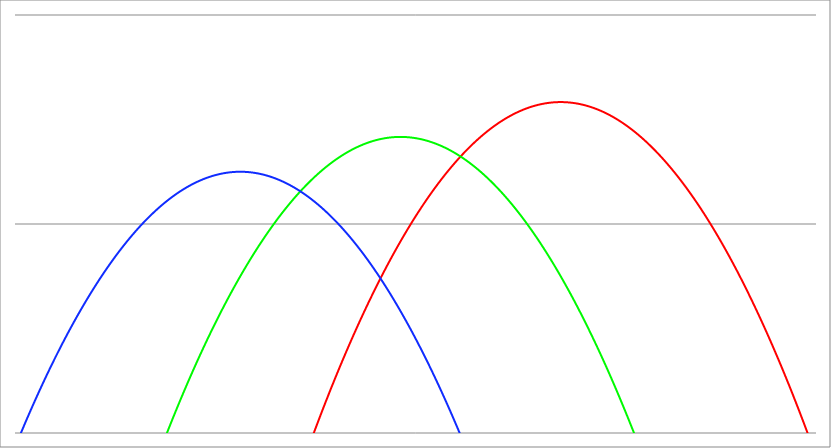
| Category | Series 1 | Series 0 | Series 2 |
|---|---|---|---|
| -4.8 | -42.74 | -20.54 | -6.34 |
| -4.795 | -42.672 | -20.492 | -6.312 |
| -4.79 | -42.604 | -20.444 | -6.284 |
| -4.785 | -42.536 | -20.396 | -6.256 |
| -4.78 | -42.468 | -20.348 | -6.228 |
| -4.775 | -42.401 | -20.301 | -6.201 |
| -4.77 | -42.333 | -20.253 | -6.173 |
| -4.765 | -42.265 | -20.205 | -6.145 |
| -4.760000000000001 | -42.198 | -20.158 | -6.118 |
| -4.755000000000001 | -42.13 | -20.11 | -6.09 |
| -4.750000000000001 | -42.063 | -20.063 | -6.063 |
| -4.745000000000001 | -41.995 | -20.015 | -6.035 |
| -4.740000000000001 | -41.928 | -19.968 | -6.008 |
| -4.735000000000001 | -41.86 | -19.92 | -5.98 |
| -4.730000000000001 | -41.793 | -19.873 | -5.953 |
| -4.725000000000001 | -41.726 | -19.826 | -5.926 |
| -4.720000000000001 | -41.658 | -19.778 | -5.898 |
| -4.715000000000002 | -41.591 | -19.731 | -5.871 |
| -4.710000000000002 | -41.524 | -19.684 | -5.844 |
| -4.705000000000002 | -41.457 | -19.637 | -5.817 |
| -4.700000000000002 | -41.39 | -19.59 | -5.79 |
| -4.695000000000002 | -41.323 | -19.543 | -5.763 |
| -4.690000000000002 | -41.256 | -19.496 | -5.736 |
| -4.685000000000002 | -41.189 | -19.449 | -5.709 |
| -4.680000000000002 | -41.122 | -19.402 | -5.682 |
| -4.675000000000002 | -41.056 | -19.356 | -5.656 |
| -4.670000000000002 | -40.989 | -19.309 | -5.629 |
| -4.665000000000003 | -40.922 | -19.262 | -5.602 |
| -4.660000000000003 | -40.856 | -19.216 | -5.576 |
| -4.655000000000003 | -40.789 | -19.169 | -5.549 |
| -4.650000000000003 | -40.723 | -19.123 | -5.523 |
| -4.645000000000003 | -40.656 | -19.076 | -5.496 |
| -4.640000000000003 | -40.59 | -19.03 | -5.47 |
| -4.635000000000003 | -40.523 | -18.983 | -5.443 |
| -4.630000000000003 | -40.457 | -18.937 | -5.417 |
| -4.625000000000003 | -40.391 | -18.891 | -5.391 |
| -4.620000000000004 | -40.324 | -18.844 | -5.364 |
| -4.615000000000004 | -40.258 | -18.798 | -5.338 |
| -4.610000000000004 | -40.192 | -18.752 | -5.312 |
| -4.605000000000004 | -40.126 | -18.706 | -5.286 |
| -4.600000000000004 | -40.06 | -18.66 | -5.26 |
| -4.595000000000004 | -39.994 | -18.614 | -5.234 |
| -4.590000000000004 | -39.928 | -18.568 | -5.208 |
| -4.585000000000004 | -39.862 | -18.522 | -5.182 |
| -4.580000000000004 | -39.796 | -18.476 | -5.156 |
| -4.575000000000004 | -39.731 | -18.431 | -5.131 |
| -4.570000000000004 | -39.665 | -18.385 | -5.105 |
| -4.565000000000005 | -39.599 | -18.339 | -5.079 |
| -4.560000000000005 | -39.534 | -18.294 | -5.054 |
| -4.555000000000005 | -39.468 | -18.248 | -5.028 |
| -4.550000000000005 | -39.403 | -18.203 | -5.003 |
| -4.545000000000005 | -39.337 | -18.157 | -4.977 |
| -4.540000000000005 | -39.272 | -18.112 | -4.952 |
| -4.535000000000005 | -39.206 | -18.066 | -4.926 |
| -4.530000000000005 | -39.141 | -18.021 | -4.901 |
| -4.525000000000006 | -39.076 | -17.976 | -4.876 |
| -4.520000000000006 | -39.01 | -17.93 | -4.85 |
| -4.515000000000006 | -38.945 | -17.885 | -4.825 |
| -4.510000000000006 | -38.88 | -17.84 | -4.8 |
| -4.505000000000006 | -38.815 | -17.795 | -4.775 |
| -4.500000000000006 | -38.75 | -17.75 | -4.75 |
| -4.495000000000006 | -38.685 | -17.705 | -4.725 |
| -4.490000000000006 | -38.62 | -17.66 | -4.7 |
| -4.485000000000006 | -38.555 | -17.615 | -4.675 |
| -4.480000000000006 | -38.49 | -17.57 | -4.65 |
| -4.475000000000006 | -38.426 | -17.526 | -4.626 |
| -4.470000000000006 | -38.361 | -17.481 | -4.601 |
| -4.465000000000007 | -38.296 | -17.436 | -4.576 |
| -4.460000000000007 | -38.232 | -17.392 | -4.552 |
| -4.455000000000007 | -38.167 | -17.347 | -4.527 |
| -4.450000000000007 | -38.103 | -17.303 | -4.503 |
| -4.445000000000007 | -38.038 | -17.258 | -4.478 |
| -4.440000000000007 | -37.974 | -17.214 | -4.454 |
| -4.435000000000007 | -37.909 | -17.169 | -4.429 |
| -4.430000000000007 | -37.845 | -17.125 | -4.405 |
| -4.425000000000008 | -37.781 | -17.081 | -4.381 |
| -4.420000000000008 | -37.716 | -17.036 | -4.356 |
| -4.415000000000008 | -37.652 | -16.992 | -4.332 |
| -4.410000000000008 | -37.588 | -16.948 | -4.308 |
| -4.405000000000008 | -37.524 | -16.904 | -4.284 |
| -4.400000000000008 | -37.46 | -16.86 | -4.26 |
| -4.395000000000008 | -37.396 | -16.816 | -4.236 |
| -4.390000000000008 | -37.332 | -16.772 | -4.212 |
| -4.385000000000009 | -37.268 | -16.728 | -4.188 |
| -4.380000000000009 | -37.204 | -16.684 | -4.164 |
| -4.375000000000009 | -37.141 | -16.641 | -4.141 |
| -4.370000000000009 | -37.077 | -16.597 | -4.117 |
| -4.365000000000009 | -37.013 | -16.553 | -4.093 |
| -4.360000000000009 | -36.95 | -16.51 | -4.07 |
| -4.355000000000009 | -36.886 | -16.466 | -4.046 |
| -4.350000000000009 | -36.823 | -16.423 | -4.023 |
| -4.345000000000009 | -36.759 | -16.379 | -3.999 |
| -4.34000000000001 | -36.696 | -16.336 | -3.976 |
| -4.33500000000001 | -36.632 | -16.292 | -3.952 |
| -4.33000000000001 | -36.569 | -16.249 | -3.929 |
| -4.32500000000001 | -36.506 | -16.206 | -3.906 |
| -4.32000000000001 | -36.442 | -16.162 | -3.882 |
| -4.31500000000001 | -36.379 | -16.119 | -3.859 |
| -4.31000000000001 | -36.316 | -16.076 | -3.836 |
| -4.30500000000001 | -36.253 | -16.033 | -3.813 |
| -4.30000000000001 | -36.19 | -15.99 | -3.79 |
| -4.295000000000011 | -36.127 | -15.947 | -3.767 |
| -4.290000000000011 | -36.064 | -15.904 | -3.744 |
| -4.285000000000011 | -36.001 | -15.861 | -3.721 |
| -4.280000000000011 | -35.938 | -15.818 | -3.698 |
| -4.275000000000011 | -35.876 | -15.776 | -3.676 |
| -4.270000000000011 | -35.813 | -15.733 | -3.653 |
| -4.265000000000011 | -35.75 | -15.69 | -3.63 |
| -4.260000000000011 | -35.688 | -15.648 | -3.608 |
| -4.255000000000011 | -35.625 | -15.605 | -3.585 |
| -4.250000000000012 | -35.563 | -15.563 | -3.563 |
| -4.245000000000012 | -35.5 | -15.52 | -3.54 |
| -4.240000000000012 | -35.438 | -15.478 | -3.518 |
| -4.235000000000012 | -35.375 | -15.435 | -3.495 |
| -4.230000000000012 | -35.313 | -15.393 | -3.473 |
| -4.225000000000012 | -35.251 | -15.351 | -3.451 |
| -4.220000000000012 | -35.188 | -15.308 | -3.428 |
| -4.215000000000012 | -35.126 | -15.266 | -3.406 |
| -4.210000000000012 | -35.064 | -15.224 | -3.384 |
| -4.205000000000012 | -35.002 | -15.182 | -3.362 |
| -4.200000000000013 | -34.94 | -15.14 | -3.34 |
| -4.195000000000013 | -34.878 | -15.098 | -3.318 |
| -4.190000000000013 | -34.816 | -15.056 | -3.296 |
| -4.185000000000013 | -34.754 | -15.014 | -3.274 |
| -4.180000000000013 | -34.692 | -14.972 | -3.252 |
| -4.175000000000013 | -34.631 | -14.931 | -3.231 |
| -4.170000000000013 | -34.569 | -14.889 | -3.209 |
| -4.165000000000013 | -34.507 | -14.847 | -3.187 |
| -4.160000000000013 | -34.446 | -14.806 | -3.166 |
| -4.155000000000014 | -34.384 | -14.764 | -3.144 |
| -4.150000000000014 | -34.323 | -14.723 | -3.123 |
| -4.145000000000014 | -34.261 | -14.681 | -3.101 |
| -4.140000000000014 | -34.2 | -14.64 | -3.08 |
| -4.135000000000014 | -34.138 | -14.598 | -3.058 |
| -4.130000000000014 | -34.077 | -14.557 | -3.037 |
| -4.125000000000014 | -34.016 | -14.516 | -3.016 |
| -4.120000000000014 | -33.954 | -14.474 | -2.994 |
| -4.115000000000014 | -33.893 | -14.433 | -2.973 |
| -4.110000000000015 | -33.832 | -14.392 | -2.952 |
| -4.105000000000015 | -33.771 | -14.351 | -2.931 |
| -4.100000000000015 | -33.71 | -14.31 | -2.91 |
| -4.095000000000015 | -33.649 | -14.269 | -2.889 |
| -4.090000000000015 | -33.588 | -14.228 | -2.868 |
| -4.085000000000015 | -33.527 | -14.187 | -2.847 |
| -4.080000000000015 | -33.466 | -14.146 | -2.826 |
| -4.075000000000015 | -33.406 | -14.106 | -2.806 |
| -4.070000000000015 | -33.345 | -14.065 | -2.785 |
| -4.065000000000015 | -33.284 | -14.024 | -2.764 |
| -4.060000000000016 | -33.224 | -13.984 | -2.744 |
| -4.055000000000016 | -33.163 | -13.943 | -2.723 |
| -4.050000000000016 | -33.103 | -13.903 | -2.703 |
| -4.045000000000016 | -33.042 | -13.862 | -2.682 |
| -4.040000000000016 | -32.982 | -13.822 | -2.662 |
| -4.035000000000016 | -32.921 | -13.781 | -2.641 |
| -4.030000000000016 | -32.861 | -13.741 | -2.621 |
| -4.025000000000016 | -32.801 | -13.701 | -2.601 |
| -4.020000000000016 | -32.74 | -13.66 | -2.58 |
| -4.015000000000017 | -32.68 | -13.62 | -2.56 |
| -4.010000000000017 | -32.62 | -13.58 | -2.54 |
| -4.005000000000017 | -32.56 | -13.54 | -2.52 |
| -4.000000000000017 | -32.5 | -13.5 | -2.5 |
| -3.995000000000017 | -32.44 | -13.46 | -2.48 |
| -3.990000000000017 | -32.38 | -13.42 | -2.46 |
| -3.985000000000017 | -32.32 | -13.38 | -2.44 |
| -3.980000000000017 | -32.26 | -13.34 | -2.42 |
| -3.975000000000017 | -32.201 | -13.301 | -2.401 |
| -3.970000000000017 | -32.141 | -13.261 | -2.381 |
| -3.965000000000018 | -32.081 | -13.221 | -2.361 |
| -3.960000000000018 | -32.022 | -13.182 | -2.342 |
| -3.955000000000018 | -31.962 | -13.142 | -2.322 |
| -3.950000000000018 | -31.903 | -13.103 | -2.303 |
| -3.945000000000018 | -31.843 | -13.063 | -2.283 |
| -3.940000000000018 | -31.784 | -13.024 | -2.264 |
| -3.935000000000018 | -31.724 | -12.984 | -2.244 |
| -3.930000000000018 | -31.665 | -12.945 | -2.225 |
| -3.925000000000018 | -31.606 | -12.906 | -2.206 |
| -3.920000000000019 | -31.546 | -12.866 | -2.186 |
| -3.915000000000019 | -31.487 | -12.827 | -2.167 |
| -3.910000000000019 | -31.428 | -12.788 | -2.148 |
| -3.905000000000019 | -31.369 | -12.749 | -2.129 |
| -3.900000000000019 | -31.31 | -12.71 | -2.11 |
| -3.895000000000019 | -31.251 | -12.671 | -2.091 |
| -3.890000000000019 | -31.192 | -12.632 | -2.072 |
| -3.885000000000019 | -31.133 | -12.593 | -2.053 |
| -3.880000000000019 | -31.074 | -12.554 | -2.034 |
| -3.875000000000019 | -31.016 | -12.516 | -2.016 |
| -3.87000000000002 | -30.957 | -12.477 | -1.997 |
| -3.86500000000002 | -30.898 | -12.438 | -1.978 |
| -3.86000000000002 | -30.84 | -12.4 | -1.96 |
| -3.85500000000002 | -30.781 | -12.361 | -1.941 |
| -3.85000000000002 | -30.723 | -12.323 | -1.923 |
| -3.84500000000002 | -30.664 | -12.284 | -1.904 |
| -3.84000000000002 | -30.606 | -12.246 | -1.886 |
| -3.83500000000002 | -30.547 | -12.207 | -1.867 |
| -3.83000000000002 | -30.489 | -12.169 | -1.849 |
| -3.825000000000021 | -30.431 | -12.131 | -1.831 |
| -3.820000000000021 | -30.372 | -12.092 | -1.812 |
| -3.815000000000021 | -30.314 | -12.054 | -1.794 |
| -3.810000000000021 | -30.256 | -12.016 | -1.776 |
| -3.805000000000021 | -30.198 | -11.978 | -1.758 |
| -3.800000000000021 | -30.14 | -11.94 | -1.74 |
| -3.795000000000021 | -30.082 | -11.902 | -1.722 |
| -3.790000000000021 | -30.024 | -11.864 | -1.704 |
| -3.785000000000021 | -29.966 | -11.826 | -1.686 |
| -3.780000000000021 | -29.908 | -11.788 | -1.668 |
| -3.775000000000022 | -29.851 | -11.751 | -1.651 |
| -3.770000000000022 | -29.793 | -11.713 | -1.633 |
| -3.765000000000022 | -29.735 | -11.675 | -1.615 |
| -3.760000000000022 | -29.678 | -11.638 | -1.598 |
| -3.755000000000022 | -29.62 | -11.6 | -1.58 |
| -3.750000000000022 | -29.563 | -11.563 | -1.563 |
| -3.745000000000022 | -29.505 | -11.525 | -1.545 |
| -3.740000000000022 | -29.448 | -11.488 | -1.528 |
| -3.735000000000022 | -29.39 | -11.45 | -1.51 |
| -3.730000000000023 | -29.333 | -11.413 | -1.493 |
| -3.725000000000023 | -29.276 | -11.376 | -1.476 |
| -3.720000000000023 | -29.218 | -11.338 | -1.458 |
| -3.715000000000023 | -29.161 | -11.301 | -1.441 |
| -3.710000000000023 | -29.104 | -11.264 | -1.424 |
| -3.705000000000023 | -29.047 | -11.227 | -1.407 |
| -3.700000000000023 | -28.99 | -11.19 | -1.39 |
| -3.695000000000023 | -28.933 | -11.153 | -1.373 |
| -3.690000000000023 | -28.876 | -11.116 | -1.356 |
| -3.685000000000023 | -28.819 | -11.079 | -1.339 |
| -3.680000000000024 | -28.762 | -11.042 | -1.322 |
| -3.675000000000024 | -28.706 | -11.006 | -1.306 |
| -3.670000000000024 | -28.649 | -10.969 | -1.289 |
| -3.665000000000024 | -28.592 | -10.932 | -1.272 |
| -3.660000000000024 | -28.536 | -10.896 | -1.256 |
| -3.655000000000024 | -28.479 | -10.859 | -1.239 |
| -3.650000000000024 | -28.423 | -10.823 | -1.223 |
| -3.645000000000024 | -28.366 | -10.786 | -1.206 |
| -3.640000000000024 | -28.31 | -10.75 | -1.19 |
| -3.635000000000025 | -28.253 | -10.713 | -1.173 |
| -3.630000000000025 | -28.197 | -10.677 | -1.157 |
| -3.625000000000025 | -28.141 | -10.641 | -1.141 |
| -3.620000000000025 | -28.084 | -10.604 | -1.124 |
| -3.615000000000025 | -28.028 | -10.568 | -1.108 |
| -3.610000000000025 | -27.972 | -10.532 | -1.092 |
| -3.605000000000025 | -27.916 | -10.496 | -1.076 |
| -3.600000000000025 | -27.86 | -10.46 | -1.06 |
| -3.595000000000025 | -27.804 | -10.424 | -1.044 |
| -3.590000000000026 | -27.748 | -10.388 | -1.028 |
| -3.585000000000026 | -27.692 | -10.352 | -1.012 |
| -3.580000000000026 | -27.636 | -10.316 | -0.996 |
| -3.575000000000026 | -27.581 | -10.281 | -0.981 |
| -3.570000000000026 | -27.525 | -10.245 | -0.965 |
| -3.565000000000026 | -27.469 | -10.209 | -0.949 |
| -3.560000000000026 | -27.414 | -10.174 | -0.934 |
| -3.555000000000026 | -27.358 | -10.138 | -0.918 |
| -3.550000000000026 | -27.303 | -10.103 | -0.903 |
| -3.545000000000027 | -27.247 | -10.067 | -0.887 |
| -3.540000000000027 | -27.192 | -10.032 | -0.872 |
| -3.535000000000027 | -27.136 | -9.996 | -0.856 |
| -3.530000000000027 | -27.081 | -9.961 | -0.841 |
| -3.525000000000027 | -27.026 | -9.926 | -0.826 |
| -3.520000000000027 | -26.97 | -9.89 | -0.81 |
| -3.515000000000027 | -26.915 | -9.855 | -0.795 |
| -3.510000000000027 | -26.86 | -9.82 | -0.78 |
| -3.505000000000027 | -26.805 | -9.785 | -0.765 |
| -3.500000000000028 | -26.75 | -9.75 | -0.75 |
| -3.495000000000028 | -26.695 | -9.715 | -0.735 |
| -3.490000000000028 | -26.64 | -9.68 | -0.72 |
| -3.485000000000028 | -26.585 | -9.645 | -0.705 |
| -3.480000000000028 | -26.53 | -9.61 | -0.69 |
| -3.475000000000028 | -26.476 | -9.576 | -0.676 |
| -3.470000000000028 | -26.421 | -9.541 | -0.661 |
| -3.465000000000028 | -26.366 | -9.506 | -0.646 |
| -3.460000000000028 | -26.312 | -9.472 | -0.632 |
| -3.455000000000028 | -26.257 | -9.437 | -0.617 |
| -3.450000000000029 | -26.203 | -9.403 | -0.603 |
| -3.445000000000029 | -26.148 | -9.368 | -0.588 |
| -3.440000000000029 | -26.094 | -9.334 | -0.574 |
| -3.435000000000029 | -26.039 | -9.299 | -0.559 |
| -3.430000000000029 | -25.985 | -9.265 | -0.545 |
| -3.425000000000029 | -25.931 | -9.231 | -0.531 |
| -3.420000000000029 | -25.876 | -9.196 | -0.516 |
| -3.415000000000029 | -25.822 | -9.162 | -0.502 |
| -3.410000000000029 | -25.768 | -9.128 | -0.488 |
| -3.40500000000003 | -25.714 | -9.094 | -0.474 |
| -3.40000000000003 | -25.66 | -9.06 | -0.46 |
| -3.39500000000003 | -25.606 | -9.026 | -0.446 |
| -3.39000000000003 | -25.552 | -8.992 | -0.432 |
| -3.38500000000003 | -25.498 | -8.958 | -0.418 |
| -3.38000000000003 | -25.444 | -8.924 | -0.404 |
| -3.37500000000003 | -25.391 | -8.891 | -0.391 |
| -3.37000000000003 | -25.337 | -8.857 | -0.377 |
| -3.36500000000003 | -25.283 | -8.823 | -0.363 |
| -3.36000000000003 | -25.23 | -8.79 | -0.35 |
| -3.355000000000031 | -25.176 | -8.756 | -0.336 |
| -3.350000000000031 | -25.123 | -8.723 | -0.323 |
| -3.345000000000031 | -25.069 | -8.689 | -0.309 |
| -3.340000000000031 | -25.016 | -8.656 | -0.296 |
| -3.335000000000031 | -24.962 | -8.622 | -0.282 |
| -3.330000000000031 | -24.909 | -8.589 | -0.269 |
| -3.325000000000031 | -24.856 | -8.556 | -0.256 |
| -3.320000000000031 | -24.802 | -8.522 | -0.242 |
| -3.315000000000031 | -24.749 | -8.489 | -0.229 |
| -3.310000000000032 | -24.696 | -8.456 | -0.216 |
| -3.305000000000032 | -24.643 | -8.423 | -0.203 |
| -3.300000000000032 | -24.59 | -8.39 | -0.19 |
| -3.295000000000032 | -24.537 | -8.357 | -0.177 |
| -3.290000000000032 | -24.484 | -8.324 | -0.164 |
| -3.285000000000032 | -24.431 | -8.291 | -0.151 |
| -3.280000000000032 | -24.378 | -8.258 | -0.138 |
| -3.275000000000032 | -24.326 | -8.226 | -0.126 |
| -3.270000000000032 | -24.273 | -8.193 | -0.113 |
| -3.265000000000032 | -24.22 | -8.16 | -0.1 |
| -3.260000000000032 | -24.168 | -8.128 | -0.088 |
| -3.255000000000033 | -24.115 | -8.095 | -0.075 |
| -3.250000000000033 | -24.063 | -8.063 | -0.063 |
| -3.245000000000033 | -24.01 | -8.03 | -0.05 |
| -3.240000000000033 | -23.958 | -7.998 | -0.038 |
| -3.235000000000033 | -23.905 | -7.965 | -0.025 |
| -3.230000000000033 | -23.853 | -7.933 | -0.013 |
| -3.225000000000033 | -23.801 | -7.901 | -0.001 |
| -3.220000000000033 | -23.748 | -7.868 | 0.012 |
| -3.215000000000034 | -23.696 | -7.836 | 0.024 |
| -3.210000000000034 | -23.644 | -7.804 | 0.036 |
| -3.205000000000034 | -23.592 | -7.772 | 0.048 |
| -3.200000000000034 | -23.54 | -7.74 | 0.06 |
| -3.195000000000034 | -23.488 | -7.708 | 0.072 |
| -3.190000000000034 | -23.436 | -7.676 | 0.084 |
| -3.185000000000034 | -23.384 | -7.644 | 0.096 |
| -3.180000000000034 | -23.332 | -7.612 | 0.108 |
| -3.175000000000034 | -23.281 | -7.581 | 0.119 |
| -3.170000000000035 | -23.229 | -7.549 | 0.131 |
| -3.165000000000035 | -23.177 | -7.517 | 0.143 |
| -3.160000000000035 | -23.126 | -7.486 | 0.154 |
| -3.155000000000035 | -23.074 | -7.454 | 0.166 |
| -3.150000000000035 | -23.023 | -7.423 | 0.177 |
| -3.145000000000035 | -22.971 | -7.391 | 0.189 |
| -3.140000000000035 | -22.92 | -7.36 | 0.2 |
| -3.135000000000035 | -22.868 | -7.328 | 0.212 |
| -3.130000000000035 | -22.817 | -7.297 | 0.223 |
| -3.125000000000036 | -22.766 | -7.266 | 0.234 |
| -3.120000000000036 | -22.714 | -7.234 | 0.246 |
| -3.115000000000036 | -22.663 | -7.203 | 0.257 |
| -3.110000000000036 | -22.612 | -7.172 | 0.268 |
| -3.105000000000036 | -22.561 | -7.141 | 0.279 |
| -3.100000000000036 | -22.51 | -7.11 | 0.29 |
| -3.095000000000036 | -22.459 | -7.079 | 0.301 |
| -3.090000000000036 | -22.408 | -7.048 | 0.312 |
| -3.085000000000036 | -22.357 | -7.017 | 0.323 |
| -3.080000000000036 | -22.306 | -6.986 | 0.334 |
| -3.075000000000037 | -22.256 | -6.956 | 0.344 |
| -3.070000000000037 | -22.205 | -6.925 | 0.355 |
| -3.065000000000037 | -22.154 | -6.894 | 0.366 |
| -3.060000000000037 | -22.104 | -6.864 | 0.376 |
| -3.055000000000037 | -22.053 | -6.833 | 0.387 |
| -3.050000000000037 | -22.003 | -6.803 | 0.397 |
| -3.045000000000037 | -21.952 | -6.772 | 0.408 |
| -3.040000000000037 | -21.902 | -6.742 | 0.418 |
| -3.035000000000037 | -21.851 | -6.711 | 0.429 |
| -3.030000000000038 | -21.801 | -6.681 | 0.439 |
| -3.025000000000038 | -21.751 | -6.651 | 0.449 |
| -3.020000000000038 | -21.7 | -6.62 | 0.46 |
| -3.015000000000038 | -21.65 | -6.59 | 0.47 |
| -3.010000000000038 | -21.6 | -6.56 | 0.48 |
| -3.005000000000038 | -21.55 | -6.53 | 0.49 |
| -3.000000000000038 | -21.5 | -6.5 | 0.5 |
| -2.995000000000038 | -21.45 | -6.47 | 0.51 |
| -2.990000000000038 | -21.4 | -6.44 | 0.52 |
| -2.985000000000038 | -21.35 | -6.41 | 0.53 |
| -2.980000000000039 | -21.3 | -6.38 | 0.54 |
| -2.975000000000039 | -21.251 | -6.351 | 0.549 |
| -2.970000000000039 | -21.201 | -6.321 | 0.559 |
| -2.965000000000039 | -21.151 | -6.291 | 0.569 |
| -2.96000000000004 | -21.102 | -6.262 | 0.578 |
| -2.955000000000039 | -21.052 | -6.232 | 0.588 |
| -2.950000000000039 | -21.003 | -6.203 | 0.597 |
| -2.945000000000039 | -20.953 | -6.173 | 0.607 |
| -2.940000000000039 | -20.904 | -6.144 | 0.616 |
| -2.93500000000004 | -20.854 | -6.114 | 0.626 |
| -2.93000000000004 | -20.805 | -6.085 | 0.635 |
| -2.92500000000004 | -20.756 | -6.056 | 0.644 |
| -2.92000000000004 | -20.706 | -6.026 | 0.654 |
| -2.91500000000004 | -20.657 | -5.997 | 0.663 |
| -2.91000000000004 | -20.608 | -5.968 | 0.672 |
| -2.90500000000004 | -20.559 | -5.939 | 0.681 |
| -2.90000000000004 | -20.51 | -5.91 | 0.69 |
| -2.89500000000004 | -20.461 | -5.881 | 0.699 |
| -2.89000000000004 | -20.412 | -5.852 | 0.708 |
| -2.885000000000041 | -20.363 | -5.823 | 0.717 |
| -2.880000000000041 | -20.314 | -5.794 | 0.726 |
| -2.875000000000041 | -20.266 | -5.766 | 0.734 |
| -2.870000000000041 | -20.217 | -5.737 | 0.743 |
| -2.865000000000041 | -20.168 | -5.708 | 0.752 |
| -2.860000000000041 | -20.12 | -5.68 | 0.76 |
| -2.855000000000041 | -20.071 | -5.651 | 0.769 |
| -2.850000000000041 | -20.023 | -5.623 | 0.777 |
| -2.845000000000041 | -19.974 | -5.594 | 0.786 |
| -2.840000000000042 | -19.926 | -5.566 | 0.794 |
| -2.835000000000042 | -19.877 | -5.537 | 0.803 |
| -2.830000000000042 | -19.829 | -5.509 | 0.811 |
| -2.825000000000042 | -19.781 | -5.481 | 0.819 |
| -2.820000000000042 | -19.732 | -5.452 | 0.828 |
| -2.815000000000042 | -19.684 | -5.424 | 0.836 |
| -2.810000000000042 | -19.636 | -5.396 | 0.844 |
| -2.805000000000042 | -19.588 | -5.368 | 0.852 |
| -2.800000000000042 | -19.54 | -5.34 | 0.86 |
| -2.795000000000042 | -19.492 | -5.312 | 0.868 |
| -2.790000000000043 | -19.444 | -5.284 | 0.876 |
| -2.785000000000043 | -19.396 | -5.256 | 0.884 |
| -2.780000000000043 | -19.348 | -5.228 | 0.892 |
| -2.775000000000043 | -19.301 | -5.201 | 0.899 |
| -2.770000000000043 | -19.253 | -5.173 | 0.907 |
| -2.765000000000043 | -19.205 | -5.145 | 0.915 |
| -2.760000000000043 | -19.158 | -5.118 | 0.922 |
| -2.755000000000043 | -19.11 | -5.09 | 0.93 |
| -2.750000000000043 | -19.063 | -5.063 | 0.937 |
| -2.745000000000044 | -19.015 | -5.035 | 0.945 |
| -2.740000000000044 | -18.968 | -5.008 | 0.952 |
| -2.735000000000044 | -18.92 | -4.98 | 0.96 |
| -2.730000000000044 | -18.873 | -4.953 | 0.967 |
| -2.725000000000044 | -18.826 | -4.926 | 0.974 |
| -2.720000000000044 | -18.778 | -4.898 | 0.982 |
| -2.715000000000044 | -18.731 | -4.871 | 0.989 |
| -2.710000000000044 | -18.684 | -4.844 | 0.996 |
| -2.705000000000044 | -18.637 | -4.817 | 1.003 |
| -2.700000000000045 | -18.59 | -4.79 | 1.01 |
| -2.695000000000045 | -18.543 | -4.763 | 1.017 |
| -2.690000000000045 | -18.496 | -4.736 | 1.024 |
| -2.685000000000045 | -18.449 | -4.709 | 1.031 |
| -2.680000000000045 | -18.402 | -4.682 | 1.038 |
| -2.675000000000045 | -18.356 | -4.656 | 1.044 |
| -2.670000000000045 | -18.309 | -4.629 | 1.051 |
| -2.665000000000045 | -18.262 | -4.602 | 1.058 |
| -2.660000000000045 | -18.216 | -4.576 | 1.064 |
| -2.655000000000045 | -18.169 | -4.549 | 1.071 |
| -2.650000000000046 | -18.123 | -4.523 | 1.077 |
| -2.645000000000046 | -18.076 | -4.496 | 1.084 |
| -2.640000000000046 | -18.03 | -4.47 | 1.09 |
| -2.635000000000046 | -17.983 | -4.443 | 1.097 |
| -2.630000000000046 | -17.937 | -4.417 | 1.103 |
| -2.625000000000046 | -17.891 | -4.391 | 1.109 |
| -2.620000000000046 | -17.844 | -4.364 | 1.116 |
| -2.615000000000046 | -17.798 | -4.338 | 1.122 |
| -2.610000000000046 | -17.752 | -4.312 | 1.128 |
| -2.605000000000047 | -17.706 | -4.286 | 1.134 |
| -2.600000000000047 | -17.66 | -4.26 | 1.14 |
| -2.595000000000047 | -17.614 | -4.234 | 1.146 |
| -2.590000000000047 | -17.568 | -4.208 | 1.152 |
| -2.585000000000047 | -17.522 | -4.182 | 1.158 |
| -2.580000000000047 | -17.476 | -4.156 | 1.164 |
| -2.575000000000047 | -17.431 | -4.131 | 1.169 |
| -2.570000000000047 | -17.385 | -4.105 | 1.175 |
| -2.565000000000047 | -17.339 | -4.079 | 1.181 |
| -2.560000000000048 | -17.294 | -4.054 | 1.186 |
| -2.555000000000048 | -17.248 | -4.028 | 1.192 |
| -2.550000000000048 | -17.203 | -4.003 | 1.197 |
| -2.545000000000048 | -17.157 | -3.977 | 1.203 |
| -2.540000000000048 | -17.112 | -3.952 | 1.208 |
| -2.535000000000048 | -17.066 | -3.926 | 1.214 |
| -2.530000000000048 | -17.021 | -3.901 | 1.219 |
| -2.525000000000048 | -16.976 | -3.876 | 1.224 |
| -2.520000000000048 | -16.93 | -3.85 | 1.23 |
| -2.515000000000049 | -16.885 | -3.825 | 1.235 |
| -2.510000000000049 | -16.84 | -3.8 | 1.24 |
| -2.505000000000049 | -16.795 | -3.775 | 1.245 |
| -2.500000000000049 | -16.75 | -3.75 | 1.25 |
| -2.495000000000049 | -16.705 | -3.725 | 1.255 |
| -2.490000000000049 | -16.66 | -3.7 | 1.26 |
| -2.485000000000049 | -16.615 | -3.675 | 1.265 |
| -2.480000000000049 | -16.57 | -3.65 | 1.27 |
| -2.475000000000049 | -16.526 | -3.626 | 1.274 |
| -2.470000000000049 | -16.481 | -3.601 | 1.279 |
| -2.46500000000005 | -16.436 | -3.576 | 1.284 |
| -2.46000000000005 | -16.392 | -3.552 | 1.288 |
| -2.45500000000005 | -16.347 | -3.527 | 1.293 |
| -2.45000000000005 | -16.303 | -3.503 | 1.297 |
| -2.44500000000005 | -16.258 | -3.478 | 1.302 |
| -2.44000000000005 | -16.214 | -3.454 | 1.306 |
| -2.43500000000005 | -16.169 | -3.429 | 1.311 |
| -2.43000000000005 | -16.125 | -3.405 | 1.315 |
| -2.42500000000005 | -16.081 | -3.381 | 1.319 |
| -2.420000000000051 | -16.036 | -3.356 | 1.324 |
| -2.415000000000051 | -15.992 | -3.332 | 1.328 |
| -2.410000000000051 | -15.948 | -3.308 | 1.332 |
| -2.405000000000051 | -15.904 | -3.284 | 1.336 |
| -2.400000000000051 | -15.86 | -3.26 | 1.34 |
| -2.395000000000051 | -15.816 | -3.236 | 1.344 |
| -2.390000000000051 | -15.772 | -3.212 | 1.348 |
| -2.385000000000051 | -15.728 | -3.188 | 1.352 |
| -2.380000000000051 | -15.684 | -3.164 | 1.356 |
| -2.375000000000051 | -15.641 | -3.141 | 1.359 |
| -2.370000000000052 | -15.597 | -3.117 | 1.363 |
| -2.365000000000052 | -15.553 | -3.093 | 1.367 |
| -2.360000000000052 | -15.51 | -3.07 | 1.37 |
| -2.355000000000052 | -15.466 | -3.046 | 1.374 |
| -2.350000000000052 | -15.423 | -3.023 | 1.377 |
| -2.345000000000052 | -15.379 | -2.999 | 1.381 |
| -2.340000000000052 | -15.336 | -2.976 | 1.384 |
| -2.335000000000052 | -15.292 | -2.952 | 1.388 |
| -2.330000000000052 | -15.249 | -2.929 | 1.391 |
| -2.325000000000053 | -15.206 | -2.906 | 1.394 |
| -2.320000000000053 | -15.162 | -2.882 | 1.398 |
| -2.315000000000053 | -15.119 | -2.859 | 1.401 |
| -2.310000000000053 | -15.076 | -2.836 | 1.404 |
| -2.305000000000053 | -15.033 | -2.813 | 1.407 |
| -2.300000000000053 | -14.99 | -2.79 | 1.41 |
| -2.295000000000053 | -14.947 | -2.767 | 1.413 |
| -2.290000000000053 | -14.904 | -2.744 | 1.416 |
| -2.285000000000053 | -14.861 | -2.721 | 1.419 |
| -2.280000000000053 | -14.818 | -2.698 | 1.422 |
| -2.275000000000054 | -14.776 | -2.676 | 1.424 |
| -2.270000000000054 | -14.733 | -2.653 | 1.427 |
| -2.265000000000054 | -14.69 | -2.63 | 1.43 |
| -2.260000000000054 | -14.648 | -2.608 | 1.432 |
| -2.255000000000054 | -14.605 | -2.585 | 1.435 |
| -2.250000000000054 | -14.563 | -2.563 | 1.437 |
| -2.245000000000054 | -14.52 | -2.54 | 1.44 |
| -2.240000000000054 | -14.478 | -2.518 | 1.442 |
| -2.235000000000054 | -14.435 | -2.495 | 1.445 |
| -2.230000000000055 | -14.393 | -2.473 | 1.447 |
| -2.225000000000055 | -14.351 | -2.451 | 1.449 |
| -2.220000000000055 | -14.308 | -2.428 | 1.452 |
| -2.215000000000055 | -14.266 | -2.406 | 1.454 |
| -2.210000000000055 | -14.224 | -2.384 | 1.456 |
| -2.205000000000055 | -14.182 | -2.362 | 1.458 |
| -2.200000000000055 | -14.14 | -2.34 | 1.46 |
| -2.195000000000055 | -14.098 | -2.318 | 1.462 |
| -2.190000000000055 | -14.056 | -2.296 | 1.464 |
| -2.185000000000056 | -14.014 | -2.274 | 1.466 |
| -2.180000000000056 | -13.972 | -2.252 | 1.468 |
| -2.175000000000056 | -13.931 | -2.231 | 1.469 |
| -2.170000000000056 | -13.889 | -2.209 | 1.471 |
| -2.165000000000056 | -13.847 | -2.187 | 1.473 |
| -2.160000000000056 | -13.806 | -2.166 | 1.474 |
| -2.155000000000056 | -13.764 | -2.144 | 1.476 |
| -2.150000000000056 | -13.723 | -2.123 | 1.477 |
| -2.145000000000056 | -13.681 | -2.101 | 1.479 |
| -2.140000000000056 | -13.64 | -2.08 | 1.48 |
| -2.135000000000057 | -13.598 | -2.058 | 1.482 |
| -2.130000000000057 | -13.557 | -2.037 | 1.483 |
| -2.125000000000057 | -13.516 | -2.016 | 1.484 |
| -2.120000000000057 | -13.474 | -1.994 | 1.486 |
| -2.115000000000057 | -13.433 | -1.973 | 1.487 |
| -2.110000000000057 | -13.392 | -1.952 | 1.488 |
| -2.105000000000057 | -13.351 | -1.931 | 1.489 |
| -2.100000000000057 | -13.31 | -1.91 | 1.49 |
| -2.095000000000057 | -13.269 | -1.889 | 1.491 |
| -2.090000000000058 | -13.228 | -1.868 | 1.492 |
| -2.085000000000058 | -13.187 | -1.847 | 1.493 |
| -2.080000000000058 | -13.146 | -1.826 | 1.494 |
| -2.075000000000058 | -13.106 | -1.806 | 1.494 |
| -2.070000000000058 | -13.065 | -1.785 | 1.495 |
| -2.065000000000058 | -13.024 | -1.764 | 1.496 |
| -2.060000000000058 | -12.984 | -1.744 | 1.496 |
| -2.055000000000058 | -12.943 | -1.723 | 1.497 |
| -2.050000000000058 | -12.903 | -1.703 | 1.497 |
| -2.045000000000059 | -12.862 | -1.682 | 1.498 |
| -2.040000000000059 | -12.822 | -1.662 | 1.498 |
| -2.035000000000059 | -12.781 | -1.641 | 1.499 |
| -2.030000000000059 | -12.741 | -1.621 | 1.499 |
| -2.025000000000059 | -12.701 | -1.601 | 1.499 |
| -2.02000000000006 | -12.66 | -1.58 | 1.5 |
| -2.015000000000059 | -12.62 | -1.56 | 1.5 |
| -2.010000000000059 | -12.58 | -1.54 | 1.5 |
| -2.005000000000059 | -12.54 | -1.52 | 1.5 |
| -2.00000000000006 | -12.5 | -1.5 | 1.5 |
| -1.99500000000006 | -12.46 | -1.48 | 1.5 |
| -1.99000000000006 | -12.42 | -1.46 | 1.5 |
| -1.98500000000006 | -12.38 | -1.44 | 1.5 |
| -1.98000000000006 | -12.34 | -1.42 | 1.5 |
| -1.97500000000006 | -12.301 | -1.401 | 1.499 |
| -1.97000000000006 | -12.261 | -1.381 | 1.499 |
| -1.96500000000006 | -12.221 | -1.361 | 1.499 |
| -1.96000000000006 | -12.182 | -1.342 | 1.498 |
| -1.95500000000006 | -12.142 | -1.322 | 1.498 |
| -1.950000000000061 | -12.103 | -1.303 | 1.498 |
| -1.945000000000061 | -12.063 | -1.283 | 1.497 |
| -1.940000000000061 | -12.024 | -1.264 | 1.496 |
| -1.935000000000061 | -11.984 | -1.244 | 1.496 |
| -1.930000000000061 | -11.945 | -1.225 | 1.495 |
| -1.925000000000061 | -11.906 | -1.206 | 1.494 |
| -1.920000000000061 | -11.866 | -1.186 | 1.494 |
| -1.915000000000061 | -11.827 | -1.167 | 1.493 |
| -1.910000000000061 | -11.788 | -1.148 | 1.492 |
| -1.905000000000062 | -11.749 | -1.129 | 1.491 |
| -1.900000000000062 | -11.71 | -1.11 | 1.49 |
| -1.895000000000062 | -11.671 | -1.091 | 1.489 |
| -1.890000000000062 | -11.632 | -1.072 | 1.488 |
| -1.885000000000062 | -11.593 | -1.053 | 1.487 |
| -1.880000000000062 | -11.554 | -1.034 | 1.486 |
| -1.875000000000062 | -11.516 | -1.016 | 1.484 |
| -1.870000000000062 | -11.477 | -0.997 | 1.483 |
| -1.865000000000062 | -11.438 | -0.978 | 1.482 |
| -1.860000000000062 | -11.4 | -0.96 | 1.48 |
| -1.855000000000063 | -11.361 | -0.941 | 1.479 |
| -1.850000000000063 | -11.323 | -0.923 | 1.478 |
| -1.845000000000063 | -11.284 | -0.904 | 1.476 |
| -1.840000000000063 | -11.246 | -0.886 | 1.474 |
| -1.835000000000063 | -11.207 | -0.867 | 1.473 |
| -1.830000000000063 | -11.169 | -0.849 | 1.471 |
| -1.825000000000063 | -11.131 | -0.831 | 1.469 |
| -1.820000000000063 | -11.092 | -0.812 | 1.468 |
| -1.815000000000063 | -11.054 | -0.794 | 1.466 |
| -1.810000000000064 | -11.016 | -0.776 | 1.464 |
| -1.805000000000064 | -10.978 | -0.758 | 1.462 |
| -1.800000000000064 | -10.94 | -0.74 | 1.46 |
| -1.795000000000064 | -10.902 | -0.722 | 1.458 |
| -1.790000000000064 | -10.864 | -0.704 | 1.456 |
| -1.785000000000064 | -10.826 | -0.686 | 1.454 |
| -1.780000000000064 | -10.788 | -0.668 | 1.452 |
| -1.775000000000064 | -10.751 | -0.651 | 1.449 |
| -1.770000000000064 | -10.713 | -0.633 | 1.447 |
| -1.765000000000064 | -10.675 | -0.615 | 1.445 |
| -1.760000000000065 | -10.638 | -0.598 | 1.442 |
| -1.755000000000065 | -10.6 | -0.58 | 1.44 |
| -1.750000000000065 | -10.563 | -0.563 | 1.438 |
| -1.745000000000065 | -10.525 | -0.545 | 1.435 |
| -1.740000000000065 | -10.488 | -0.528 | 1.432 |
| -1.735000000000065 | -10.45 | -0.51 | 1.43 |
| -1.730000000000065 | -10.413 | -0.493 | 1.427 |
| -1.725000000000065 | -10.376 | -0.476 | 1.424 |
| -1.720000000000065 | -10.338 | -0.458 | 1.422 |
| -1.715000000000066 | -10.301 | -0.441 | 1.419 |
| -1.710000000000066 | -10.264 | -0.424 | 1.416 |
| -1.705000000000066 | -10.227 | -0.407 | 1.413 |
| -1.700000000000066 | -10.19 | -0.39 | 1.41 |
| -1.695000000000066 | -10.153 | -0.373 | 1.407 |
| -1.690000000000066 | -10.116 | -0.356 | 1.404 |
| -1.685000000000066 | -10.079 | -0.339 | 1.401 |
| -1.680000000000066 | -10.042 | -0.322 | 1.398 |
| -1.675000000000066 | -10.006 | -0.306 | 1.394 |
| -1.670000000000066 | -9.969 | -0.289 | 1.391 |
| -1.665000000000067 | -9.932 | -0.272 | 1.388 |
| -1.660000000000067 | -9.896 | -0.256 | 1.384 |
| -1.655000000000067 | -9.859 | -0.239 | 1.381 |
| -1.650000000000067 | -9.823 | -0.223 | 1.378 |
| -1.645000000000067 | -9.786 | -0.206 | 1.374 |
| -1.640000000000067 | -9.75 | -0.19 | 1.37 |
| -1.635000000000067 | -9.713 | -0.173 | 1.367 |
| -1.630000000000067 | -9.677 | -0.157 | 1.363 |
| -1.625000000000067 | -9.641 | -0.141 | 1.359 |
| -1.620000000000068 | -9.604 | -0.124 | 1.356 |
| -1.615000000000068 | -9.568 | -0.108 | 1.352 |
| -1.610000000000068 | -9.532 | -0.092 | 1.348 |
| -1.605000000000068 | -9.496 | -0.076 | 1.344 |
| -1.600000000000068 | -9.46 | -0.06 | 1.34 |
| -1.595000000000068 | -9.424 | -0.044 | 1.336 |
| -1.590000000000068 | -9.388 | -0.028 | 1.332 |
| -1.585000000000068 | -9.352 | -0.012 | 1.328 |
| -1.580000000000068 | -9.316 | 0.004 | 1.324 |
| -1.575000000000069 | -9.281 | 0.019 | 1.319 |
| -1.570000000000069 | -9.245 | 0.035 | 1.315 |
| -1.565000000000069 | -9.209 | 0.051 | 1.311 |
| -1.560000000000069 | -9.174 | 0.066 | 1.306 |
| -1.555000000000069 | -9.138 | 0.082 | 1.302 |
| -1.55000000000007 | -9.103 | 0.097 | 1.298 |
| -1.545000000000069 | -9.067 | 0.113 | 1.293 |
| -1.540000000000069 | -9.032 | 0.128 | 1.288 |
| -1.535000000000069 | -8.996 | 0.144 | 1.284 |
| -1.53000000000007 | -8.961 | 0.159 | 1.279 |
| -1.52500000000007 | -8.926 | 0.174 | 1.274 |
| -1.52000000000007 | -8.89 | 0.19 | 1.27 |
| -1.51500000000007 | -8.855 | 0.205 | 1.265 |
| -1.51000000000007 | -8.82 | 0.22 | 1.26 |
| -1.50500000000007 | -8.785 | 0.235 | 1.255 |
| -1.50000000000007 | -8.75 | 0.25 | 1.25 |
| -1.49500000000007 | -8.715 | 0.265 | 1.245 |
| -1.49000000000007 | -8.68 | 0.28 | 1.24 |
| -1.48500000000007 | -8.645 | 0.295 | 1.235 |
| -1.480000000000071 | -8.61 | 0.31 | 1.23 |
| -1.475000000000071 | -8.576 | 0.324 | 1.224 |
| -1.470000000000071 | -8.541 | 0.339 | 1.219 |
| -1.465000000000071 | -8.506 | 0.354 | 1.214 |
| -1.460000000000071 | -8.472 | 0.368 | 1.208 |
| -1.455000000000071 | -8.437 | 0.383 | 1.203 |
| -1.450000000000071 | -8.403 | 0.397 | 1.198 |
| -1.445000000000071 | -8.368 | 0.412 | 1.192 |
| -1.440000000000071 | -8.334 | 0.426 | 1.186 |
| -1.435000000000072 | -8.299 | 0.441 | 1.181 |
| -1.430000000000072 | -8.265 | 0.455 | 1.175 |
| -1.425000000000072 | -8.231 | 0.469 | 1.169 |
| -1.420000000000072 | -8.196 | 0.484 | 1.164 |
| -1.415000000000072 | -8.162 | 0.498 | 1.158 |
| -1.410000000000072 | -8.128 | 0.512 | 1.152 |
| -1.405000000000072 | -8.094 | 0.526 | 1.146 |
| -1.400000000000072 | -8.06 | 0.54 | 1.14 |
| -1.395000000000072 | -8.026 | 0.554 | 1.134 |
| -1.390000000000072 | -7.992 | 0.568 | 1.128 |
| -1.385000000000073 | -7.958 | 0.582 | 1.122 |
| -1.380000000000073 | -7.924 | 0.596 | 1.116 |
| -1.375000000000073 | -7.891 | 0.609 | 1.109 |
| -1.370000000000073 | -7.857 | 0.623 | 1.103 |
| -1.365000000000073 | -7.823 | 0.637 | 1.097 |
| -1.360000000000073 | -7.79 | 0.65 | 1.09 |
| -1.355000000000073 | -7.756 | 0.664 | 1.084 |
| -1.350000000000073 | -7.723 | 0.677 | 1.078 |
| -1.345000000000073 | -7.689 | 0.691 | 1.071 |
| -1.340000000000074 | -7.656 | 0.704 | 1.064 |
| -1.335000000000074 | -7.622 | 0.718 | 1.058 |
| -1.330000000000074 | -7.589 | 0.731 | 1.051 |
| -1.325000000000074 | -7.556 | 0.744 | 1.044 |
| -1.320000000000074 | -7.522 | 0.758 | 1.038 |
| -1.315000000000074 | -7.489 | 0.771 | 1.031 |
| -1.310000000000074 | -7.456 | 0.784 | 1.024 |
| -1.305000000000074 | -7.423 | 0.797 | 1.017 |
| -1.300000000000074 | -7.39 | 0.81 | 1.01 |
| -1.295000000000074 | -7.357 | 0.823 | 1.003 |
| -1.290000000000075 | -7.324 | 0.836 | 0.996 |
| -1.285000000000075 | -7.291 | 0.849 | 0.989 |
| -1.280000000000075 | -7.258 | 0.862 | 0.982 |
| -1.275000000000075 | -7.226 | 0.874 | 0.974 |
| -1.270000000000075 | -7.193 | 0.887 | 0.967 |
| -1.265000000000075 | -7.16 | 0.9 | 0.96 |
| -1.260000000000075 | -7.128 | 0.912 | 0.952 |
| -1.255000000000075 | -7.095 | 0.925 | 0.945 |
| -1.250000000000075 | -7.063 | 0.937 | 0.938 |
| -1.245000000000076 | -7.03 | 0.95 | 0.93 |
| -1.240000000000076 | -6.998 | 0.962 | 0.922 |
| -1.235000000000076 | -6.965 | 0.975 | 0.915 |
| -1.230000000000076 | -6.933 | 0.987 | 0.907 |
| -1.225000000000076 | -6.901 | 0.999 | 0.899 |
| -1.220000000000076 | -6.868 | 1.012 | 0.892 |
| -1.215000000000076 | -6.836 | 1.024 | 0.884 |
| -1.210000000000076 | -6.804 | 1.036 | 0.876 |
| -1.205000000000076 | -6.772 | 1.048 | 0.868 |
| -1.200000000000077 | -6.74 | 1.06 | 0.86 |
| -1.195000000000077 | -6.708 | 1.072 | 0.852 |
| -1.190000000000077 | -6.676 | 1.084 | 0.844 |
| -1.185000000000077 | -6.644 | 1.096 | 0.836 |
| -1.180000000000077 | -6.612 | 1.108 | 0.828 |
| -1.175000000000077 | -6.581 | 1.119 | 0.819 |
| -1.170000000000077 | -6.549 | 1.131 | 0.811 |
| -1.165000000000077 | -6.517 | 1.143 | 0.803 |
| -1.160000000000077 | -6.486 | 1.154 | 0.794 |
| -1.155000000000078 | -6.454 | 1.166 | 0.786 |
| -1.150000000000078 | -6.423 | 1.177 | 0.778 |
| -1.145000000000078 | -6.391 | 1.189 | 0.769 |
| -1.140000000000078 | -6.36 | 1.2 | 0.76 |
| -1.135000000000078 | -6.328 | 1.212 | 0.752 |
| -1.130000000000078 | -6.297 | 1.223 | 0.743 |
| -1.125000000000078 | -6.266 | 1.234 | 0.734 |
| -1.120000000000078 | -6.234 | 1.246 | 0.726 |
| -1.115000000000078 | -6.203 | 1.257 | 0.717 |
| -1.110000000000078 | -6.172 | 1.268 | 0.708 |
| -1.105000000000079 | -6.141 | 1.279 | 0.699 |
| -1.100000000000079 | -6.11 | 1.29 | 0.69 |
| -1.095000000000079 | -6.079 | 1.301 | 0.681 |
| -1.090000000000079 | -6.048 | 1.312 | 0.672 |
| -1.085000000000079 | -6.017 | 1.323 | 0.663 |
| -1.08000000000008 | -5.986 | 1.334 | 0.654 |
| -1.075000000000079 | -5.956 | 1.344 | 0.644 |
| -1.070000000000079 | -5.925 | 1.355 | 0.635 |
| -1.065000000000079 | -5.894 | 1.366 | 0.626 |
| -1.06000000000008 | -5.864 | 1.376 | 0.616 |
| -1.05500000000008 | -5.833 | 1.387 | 0.607 |
| -1.05000000000008 | -5.803 | 1.397 | 0.598 |
| -1.04500000000008 | -5.772 | 1.408 | 0.588 |
| -1.04000000000008 | -5.742 | 1.418 | 0.578 |
| -1.03500000000008 | -5.711 | 1.429 | 0.569 |
| -1.03000000000008 | -5.681 | 1.439 | 0.559 |
| -1.02500000000008 | -5.651 | 1.449 | 0.549 |
| -1.02000000000008 | -5.62 | 1.46 | 0.54 |
| -1.015000000000081 | -5.59 | 1.47 | 0.53 |
| -1.010000000000081 | -5.56 | 1.48 | 0.52 |
| -1.005000000000081 | -5.53 | 1.49 | 0.51 |
| -1.000000000000081 | -5.5 | 1.5 | 0.5 |
| -0.995000000000081 | -5.47 | 1.51 | 0.49 |
| -0.990000000000081 | -5.44 | 1.52 | 0.48 |
| -0.985000000000081 | -5.41 | 1.53 | 0.47 |
| -0.980000000000081 | -5.38 | 1.54 | 0.46 |
| -0.975000000000081 | -5.351 | 1.549 | 0.449 |
| -0.970000000000081 | -5.321 | 1.559 | 0.439 |
| -0.965000000000081 | -5.291 | 1.569 | 0.429 |
| -0.960000000000081 | -5.262 | 1.578 | 0.418 |
| -0.955000000000081 | -5.232 | 1.588 | 0.408 |
| -0.950000000000081 | -5.203 | 1.597 | 0.398 |
| -0.945000000000081 | -5.173 | 1.607 | 0.387 |
| -0.940000000000081 | -5.144 | 1.616 | 0.376 |
| -0.935000000000081 | -5.114 | 1.626 | 0.366 |
| -0.930000000000081 | -5.085 | 1.635 | 0.355 |
| -0.925000000000081 | -5.056 | 1.644 | 0.344 |
| -0.920000000000081 | -5.026 | 1.654 | 0.334 |
| -0.915000000000081 | -4.997 | 1.663 | 0.323 |
| -0.910000000000081 | -4.968 | 1.672 | 0.312 |
| -0.905000000000081 | -4.939 | 1.681 | 0.301 |
| -0.900000000000081 | -4.91 | 1.69 | 0.29 |
| -0.895000000000081 | -4.881 | 1.699 | 0.279 |
| -0.890000000000081 | -4.852 | 1.708 | 0.268 |
| -0.885000000000081 | -4.823 | 1.717 | 0.257 |
| -0.880000000000081 | -4.794 | 1.726 | 0.246 |
| -0.875000000000081 | -4.766 | 1.734 | 0.234 |
| -0.870000000000081 | -4.737 | 1.743 | 0.223 |
| -0.865000000000081 | -4.708 | 1.752 | 0.212 |
| -0.860000000000081 | -4.68 | 1.76 | 0.2 |
| -0.855000000000081 | -4.651 | 1.769 | 0.189 |
| -0.850000000000081 | -4.623 | 1.777 | 0.178 |
| -0.845000000000081 | -4.594 | 1.786 | 0.166 |
| -0.840000000000081 | -4.566 | 1.794 | 0.154 |
| -0.835000000000081 | -4.537 | 1.803 | 0.143 |
| -0.830000000000081 | -4.509 | 1.811 | 0.131 |
| -0.825000000000081 | -4.481 | 1.819 | 0.119 |
| -0.820000000000081 | -4.452 | 1.828 | 0.108 |
| -0.815000000000081 | -4.424 | 1.836 | 0.096 |
| -0.810000000000081 | -4.396 | 1.844 | 0.084 |
| -0.805000000000081 | -4.368 | 1.852 | 0.072 |
| -0.800000000000081 | -4.34 | 1.86 | 0.06 |
| -0.795000000000081 | -4.312 | 1.868 | 0.048 |
| -0.790000000000081 | -4.284 | 1.876 | 0.036 |
| -0.785000000000081 | -4.256 | 1.884 | 0.024 |
| -0.780000000000081 | -4.228 | 1.892 | 0.012 |
| -0.775000000000081 | -4.201 | 1.899 | -0.001 |
| -0.770000000000081 | -4.173 | 1.907 | -0.013 |
| -0.765000000000081 | -4.145 | 1.915 | -0.025 |
| -0.760000000000081 | -4.118 | 1.922 | -0.038 |
| -0.755000000000081 | -4.09 | 1.93 | -0.05 |
| -0.750000000000081 | -4.063 | 1.937 | -0.062 |
| -0.745000000000081 | -4.035 | 1.945 | -0.075 |
| -0.740000000000081 | -4.008 | 1.952 | -0.088 |
| -0.735000000000081 | -3.98 | 1.96 | -0.1 |
| -0.730000000000081 | -3.953 | 1.967 | -0.113 |
| -0.725000000000081 | -3.926 | 1.974 | -0.126 |
| -0.720000000000081 | -3.898 | 1.982 | -0.138 |
| -0.715000000000081 | -3.871 | 1.989 | -0.151 |
| -0.71000000000008 | -3.844 | 1.996 | -0.164 |
| -0.70500000000008 | -3.817 | 2.003 | -0.177 |
| -0.70000000000008 | -3.79 | 2.01 | -0.19 |
| -0.69500000000008 | -3.763 | 2.017 | -0.203 |
| -0.69000000000008 | -3.736 | 2.024 | -0.216 |
| -0.68500000000008 | -3.709 | 2.031 | -0.229 |
| -0.68000000000008 | -3.682 | 2.038 | -0.242 |
| -0.67500000000008 | -3.656 | 2.044 | -0.256 |
| -0.67000000000008 | -3.629 | 2.051 | -0.269 |
| -0.66500000000008 | -3.602 | 2.058 | -0.282 |
| -0.66000000000008 | -3.576 | 2.064 | -0.296 |
| -0.65500000000008 | -3.549 | 2.071 | -0.309 |
| -0.65000000000008 | -3.523 | 2.077 | -0.322 |
| -0.64500000000008 | -3.496 | 2.084 | -0.336 |
| -0.64000000000008 | -3.47 | 2.09 | -0.35 |
| -0.63500000000008 | -3.443 | 2.097 | -0.363 |
| -0.63000000000008 | -3.417 | 2.103 | -0.377 |
| -0.62500000000008 | -3.391 | 2.109 | -0.391 |
| -0.62000000000008 | -3.364 | 2.116 | -0.404 |
| -0.61500000000008 | -3.338 | 2.122 | -0.418 |
| -0.61000000000008 | -3.312 | 2.128 | -0.432 |
| -0.60500000000008 | -3.286 | 2.134 | -0.446 |
| -0.60000000000008 | -3.26 | 2.14 | -0.46 |
| -0.59500000000008 | -3.234 | 2.146 | -0.474 |
| -0.59000000000008 | -3.208 | 2.152 | -0.488 |
| -0.58500000000008 | -3.182 | 2.158 | -0.502 |
| -0.58000000000008 | -3.156 | 2.164 | -0.516 |
| -0.57500000000008 | -3.131 | 2.169 | -0.531 |
| -0.57000000000008 | -3.105 | 2.175 | -0.545 |
| -0.56500000000008 | -3.079 | 2.181 | -0.559 |
| -0.56000000000008 | -3.054 | 2.186 | -0.574 |
| -0.55500000000008 | -3.028 | 2.192 | -0.588 |
| -0.55000000000008 | -3.003 | 2.197 | -0.602 |
| -0.54500000000008 | -2.977 | 2.203 | -0.617 |
| -0.54000000000008 | -2.952 | 2.208 | -0.632 |
| -0.53500000000008 | -2.926 | 2.214 | -0.646 |
| -0.53000000000008 | -2.901 | 2.219 | -0.661 |
| -0.52500000000008 | -2.876 | 2.224 | -0.676 |
| -0.52000000000008 | -2.85 | 2.23 | -0.69 |
| -0.51500000000008 | -2.825 | 2.235 | -0.705 |
| -0.51000000000008 | -2.8 | 2.24 | -0.72 |
| -0.50500000000008 | -2.775 | 2.245 | -0.735 |
| -0.50000000000008 | -2.75 | 2.25 | -0.75 |
| -0.49500000000008 | -2.725 | 2.255 | -0.765 |
| -0.49000000000008 | -2.7 | 2.26 | -0.78 |
| -0.48500000000008 | -2.675 | 2.265 | -0.795 |
| -0.48000000000008 | -2.65 | 2.27 | -0.81 |
| -0.47500000000008 | -2.626 | 2.274 | -0.826 |
| -0.47000000000008 | -2.601 | 2.279 | -0.841 |
| -0.46500000000008 | -2.576 | 2.284 | -0.856 |
| -0.46000000000008 | -2.552 | 2.288 | -0.872 |
| -0.45500000000008 | -2.527 | 2.293 | -0.887 |
| -0.45000000000008 | -2.503 | 2.297 | -0.902 |
| -0.44500000000008 | -2.478 | 2.302 | -0.918 |
| -0.44000000000008 | -2.454 | 2.306 | -0.934 |
| -0.43500000000008 | -2.429 | 2.311 | -0.949 |
| -0.43000000000008 | -2.405 | 2.315 | -0.965 |
| -0.42500000000008 | -2.381 | 2.319 | -0.981 |
| -0.42000000000008 | -2.356 | 2.324 | -0.996 |
| -0.41500000000008 | -2.332 | 2.328 | -1.012 |
| -0.41000000000008 | -2.308 | 2.332 | -1.028 |
| -0.40500000000008 | -2.284 | 2.336 | -1.044 |
| -0.40000000000008 | -2.26 | 2.34 | -1.06 |
| -0.39500000000008 | -2.236 | 2.344 | -1.076 |
| -0.39000000000008 | -2.212 | 2.348 | -1.092 |
| -0.38500000000008 | -2.188 | 2.352 | -1.108 |
| -0.38000000000008 | -2.164 | 2.356 | -1.124 |
| -0.37500000000008 | -2.141 | 2.359 | -1.141 |
| -0.37000000000008 | -2.117 | 2.363 | -1.157 |
| -0.36500000000008 | -2.093 | 2.367 | -1.173 |
| -0.36000000000008 | -2.07 | 2.37 | -1.19 |
| -0.35500000000008 | -2.046 | 2.374 | -1.206 |
| -0.35000000000008 | -2.023 | 2.377 | -1.222 |
| -0.34500000000008 | -1.999 | 2.381 | -1.239 |
| -0.34000000000008 | -1.976 | 2.384 | -1.256 |
| -0.33500000000008 | -1.952 | 2.388 | -1.272 |
| -0.33000000000008 | -1.929 | 2.391 | -1.289 |
| -0.32500000000008 | -1.906 | 2.394 | -1.306 |
| -0.32000000000008 | -1.882 | 2.398 | -1.322 |
| -0.31500000000008 | -1.859 | 2.401 | -1.339 |
| -0.31000000000008 | -1.836 | 2.404 | -1.356 |
| -0.30500000000008 | -1.813 | 2.407 | -1.373 |
| -0.30000000000008 | -1.79 | 2.41 | -1.39 |
| -0.29500000000008 | -1.767 | 2.413 | -1.407 |
| -0.29000000000008 | -1.744 | 2.416 | -1.424 |
| -0.28500000000008 | -1.721 | 2.419 | -1.441 |
| -0.28000000000008 | -1.698 | 2.422 | -1.458 |
| -0.27500000000008 | -1.676 | 2.424 | -1.476 |
| -0.27000000000008 | -1.653 | 2.427 | -1.493 |
| -0.26500000000008 | -1.63 | 2.43 | -1.51 |
| -0.26000000000008 | -1.608 | 2.432 | -1.528 |
| -0.25500000000008 | -1.585 | 2.435 | -1.545 |
| -0.25000000000008 | -1.563 | 2.437 | -1.562 |
| -0.24500000000008 | -1.54 | 2.44 | -1.58 |
| -0.24000000000008 | -1.518 | 2.442 | -1.598 |
| -0.23500000000008 | -1.495 | 2.445 | -1.615 |
| -0.23000000000008 | -1.473 | 2.447 | -1.633 |
| -0.22500000000008 | -1.451 | 2.449 | -1.651 |
| -0.22000000000008 | -1.428 | 2.452 | -1.668 |
| -0.21500000000008 | -1.406 | 2.454 | -1.686 |
| -0.21000000000008 | -1.384 | 2.456 | -1.704 |
| -0.20500000000008 | -1.362 | 2.458 | -1.722 |
| -0.20000000000008 | -1.34 | 2.46 | -1.74 |
| -0.19500000000008 | -1.318 | 2.462 | -1.758 |
| -0.19000000000008 | -1.296 | 2.464 | -1.776 |
| -0.18500000000008 | -1.274 | 2.466 | -1.794 |
| -0.18000000000008 | -1.252 | 2.468 | -1.812 |
| -0.17500000000008 | -1.231 | 2.469 | -1.831 |
| -0.17000000000008 | -1.209 | 2.471 | -1.849 |
| -0.16500000000008 | -1.187 | 2.473 | -1.867 |
| -0.16000000000008 | -1.166 | 2.474 | -1.886 |
| -0.15500000000008 | -1.144 | 2.476 | -1.904 |
| -0.15000000000008 | -1.123 | 2.477 | -1.922 |
| -0.14500000000008 | -1.101 | 2.479 | -1.941 |
| -0.14000000000008 | -1.08 | 2.48 | -1.96 |
| -0.13500000000008 | -1.058 | 2.482 | -1.978 |
| -0.13000000000008 | -1.037 | 2.483 | -1.997 |
| -0.12500000000008 | -1.016 | 2.484 | -2.016 |
| -0.12000000000008 | -0.994 | 2.486 | -2.034 |
| -0.11500000000008 | -0.973 | 2.487 | -2.053 |
| -0.11000000000008 | -0.952 | 2.488 | -2.072 |
| -0.10500000000008 | -0.931 | 2.489 | -2.091 |
| -0.10000000000008 | -0.91 | 2.49 | -2.11 |
| -0.09500000000008 | -0.889 | 2.491 | -2.129 |
| -0.09000000000008 | -0.868 | 2.492 | -2.148 |
| -0.08500000000008 | -0.847 | 2.493 | -2.167 |
| -0.08000000000008 | -0.826 | 2.494 | -2.186 |
| -0.07500000000008 | -0.806 | 2.494 | -2.206 |
| -0.07000000000008 | -0.785 | 2.495 | -2.225 |
| -0.06500000000008 | -0.764 | 2.496 | -2.244 |
| -0.06000000000008 | -0.744 | 2.496 | -2.264 |
| -0.05500000000008 | -0.723 | 2.497 | -2.283 |
| -0.05000000000008 | -0.703 | 2.497 | -2.302 |
| -0.04500000000008 | -0.682 | 2.498 | -2.322 |
| -0.04000000000008 | -0.662 | 2.498 | -2.342 |
| -0.03500000000008 | -0.641 | 2.499 | -2.361 |
| -0.03000000000008 | -0.621 | 2.499 | -2.381 |
| -0.02500000000008 | -0.601 | 2.499 | -2.401 |
| -0.02000000000008 | -0.58 | 2.5 | -2.42 |
| -0.01500000000008 | -0.56 | 2.5 | -2.44 |
| -0.01000000000008 | -0.54 | 2.5 | -2.46 |
| -0.00500000000008 | -0.52 | 2.5 | -2.48 |
| -8.00037119885743e-14 | -0.5 | 2.5 | -2.5 |
| 0.00499999999992 | -0.48 | 2.5 | -2.52 |
| 0.00999999999991999 | -0.46 | 2.5 | -2.54 |
| 0.01499999999992 | -0.44 | 2.5 | -2.56 |
| 0.01999999999992 | -0.42 | 2.5 | -2.58 |
| 0.02499999999992 | -0.401 | 2.499 | -2.601 |
| 0.02999999999992 | -0.381 | 2.499 | -2.621 |
| 0.03499999999992 | -0.361 | 2.499 | -2.641 |
| 0.03999999999992 | -0.342 | 2.498 | -2.662 |
| 0.04499999999992 | -0.322 | 2.498 | -2.682 |
| 0.04999999999992 | -0.303 | 2.498 | -2.702 |
| 0.05499999999992 | -0.283 | 2.497 | -2.723 |
| 0.05999999999992 | -0.264 | 2.496 | -2.744 |
| 0.06499999999992 | -0.244 | 2.496 | -2.764 |
| 0.06999999999992 | -0.225 | 2.495 | -2.785 |
| 0.07499999999992 | -0.206 | 2.494 | -2.806 |
| 0.07999999999992 | -0.186 | 2.494 | -2.826 |
| 0.08499999999992 | -0.167 | 2.493 | -2.847 |
| 0.08999999999992 | -0.148 | 2.492 | -2.868 |
| 0.09499999999992 | -0.129 | 2.491 | -2.889 |
| 0.09999999999992 | -0.11 | 2.49 | -2.91 |
| 0.10499999999992 | -0.091 | 2.489 | -2.931 |
| 0.10999999999992 | -0.072 | 2.488 | -2.952 |
| 0.11499999999992 | -0.053 | 2.487 | -2.973 |
| 0.11999999999992 | -0.034 | 2.486 | -2.994 |
| 0.12499999999992 | -0.016 | 2.484 | -3.016 |
| 0.12999999999992 | 0.003 | 2.483 | -3.037 |
| 0.13499999999992 | 0.022 | 2.482 | -3.058 |
| 0.13999999999992 | 0.04 | 2.48 | -3.08 |
| 0.14499999999992 | 0.059 | 2.479 | -3.101 |
| 0.14999999999992 | 0.077 | 2.478 | -3.122 |
| 0.15499999999992 | 0.096 | 2.476 | -3.144 |
| 0.15999999999992 | 0.114 | 2.474 | -3.166 |
| 0.16499999999992 | 0.133 | 2.473 | -3.187 |
| 0.16999999999992 | 0.151 | 2.471 | -3.209 |
| 0.17499999999992 | 0.169 | 2.469 | -3.231 |
| 0.17999999999992 | 0.188 | 2.468 | -3.252 |
| 0.18499999999992 | 0.206 | 2.466 | -3.274 |
| 0.18999999999992 | 0.224 | 2.464 | -3.296 |
| 0.19499999999992 | 0.242 | 2.462 | -3.318 |
| 0.19999999999992 | 0.26 | 2.46 | -3.34 |
| 0.20499999999992 | 0.278 | 2.458 | -3.362 |
| 0.20999999999992 | 0.296 | 2.456 | -3.384 |
| 0.21499999999992 | 0.314 | 2.454 | -3.406 |
| 0.21999999999992 | 0.332 | 2.452 | -3.428 |
| 0.22499999999992 | 0.349 | 2.449 | -3.451 |
| 0.22999999999992 | 0.367 | 2.447 | -3.473 |
| 0.23499999999992 | 0.385 | 2.445 | -3.495 |
| 0.23999999999992 | 0.402 | 2.442 | -3.518 |
| 0.24499999999992 | 0.42 | 2.44 | -3.54 |
| 0.24999999999992 | 0.437 | 2.438 | -3.562 |
| 0.25499999999992 | 0.455 | 2.435 | -3.585 |
| 0.25999999999992 | 0.472 | 2.432 | -3.608 |
| 0.26499999999992 | 0.49 | 2.43 | -3.63 |
| 0.26999999999992 | 0.507 | 2.427 | -3.653 |
| 0.27499999999992 | 0.524 | 2.424 | -3.676 |
| 0.27999999999992 | 0.542 | 2.422 | -3.698 |
| 0.28499999999992 | 0.559 | 2.419 | -3.721 |
| 0.28999999999992 | 0.576 | 2.416 | -3.744 |
| 0.29499999999992 | 0.593 | 2.413 | -3.767 |
| 0.29999999999992 | 0.61 | 2.41 | -3.79 |
| 0.30499999999992 | 0.627 | 2.407 | -3.813 |
| 0.30999999999992 | 0.644 | 2.404 | -3.836 |
| 0.31499999999992 | 0.661 | 2.401 | -3.859 |
| 0.31999999999992 | 0.678 | 2.398 | -3.882 |
| 0.32499999999992 | 0.694 | 2.394 | -3.906 |
| 0.32999999999992 | 0.711 | 2.391 | -3.929 |
| 0.33499999999992 | 0.728 | 2.388 | -3.952 |
| 0.33999999999992 | 0.744 | 2.384 | -3.976 |
| 0.34499999999992 | 0.761 | 2.381 | -3.999 |
| 0.34999999999992 | 0.777 | 2.378 | -4.022 |
| 0.35499999999992 | 0.794 | 2.374 | -4.046 |
| 0.35999999999992 | 0.81 | 2.37 | -4.07 |
| 0.36499999999992 | 0.827 | 2.367 | -4.093 |
| 0.36999999999992 | 0.843 | 2.363 | -4.117 |
| 0.37499999999992 | 0.859 | 2.359 | -4.141 |
| 0.37999999999992 | 0.876 | 2.356 | -4.164 |
| 0.38499999999992 | 0.892 | 2.352 | -4.188 |
| 0.38999999999992 | 0.908 | 2.348 | -4.212 |
| 0.39499999999992 | 0.924 | 2.344 | -4.236 |
| 0.39999999999992 | 0.94 | 2.34 | -4.26 |
| 0.40499999999992 | 0.956 | 2.336 | -4.284 |
| 0.40999999999992 | 0.972 | 2.332 | -4.308 |
| 0.41499999999992 | 0.988 | 2.328 | -4.332 |
| 0.41999999999992 | 1.004 | 2.324 | -4.356 |
| 0.42499999999992 | 1.019 | 2.319 | -4.381 |
| 0.42999999999992 | 1.035 | 2.315 | -4.405 |
| 0.43499999999992 | 1.051 | 2.311 | -4.429 |
| 0.43999999999992 | 1.066 | 2.306 | -4.454 |
| 0.44499999999992 | 1.082 | 2.302 | -4.478 |
| 0.44999999999992 | 1.097 | 2.298 | -4.502 |
| 0.45499999999992 | 1.113 | 2.293 | -4.527 |
| 0.45999999999992 | 1.128 | 2.288 | -4.552 |
| 0.46499999999992 | 1.144 | 2.284 | -4.576 |
| 0.46999999999992 | 1.159 | 2.279 | -4.601 |
| 0.47499999999992 | 1.174 | 2.274 | -4.626 |
| 0.47999999999992 | 1.19 | 2.27 | -4.65 |
| 0.48499999999992 | 1.205 | 2.265 | -4.675 |
| 0.48999999999992 | 1.22 | 2.26 | -4.7 |
| 0.49499999999992 | 1.235 | 2.255 | -4.725 |
| 0.49999999999992 | 1.25 | 2.25 | -4.75 |
| 0.50499999999992 | 1.265 | 2.245 | -4.775 |
| 0.50999999999992 | 1.28 | 2.24 | -4.8 |
| 0.51499999999992 | 1.295 | 2.235 | -4.825 |
| 0.51999999999992 | 1.31 | 2.23 | -4.85 |
| 0.52499999999992 | 1.324 | 2.224 | -4.876 |
| 0.52999999999992 | 1.339 | 2.219 | -4.901 |
| 0.53499999999992 | 1.354 | 2.214 | -4.926 |
| 0.53999999999992 | 1.368 | 2.208 | -4.952 |
| 0.54499999999992 | 1.383 | 2.203 | -4.977 |
| 0.54999999999992 | 1.397 | 2.198 | -5.002 |
| 0.55499999999992 | 1.412 | 2.192 | -5.028 |
| 0.55999999999992 | 1.426 | 2.186 | -5.054 |
| 0.56499999999992 | 1.441 | 2.181 | -5.079 |
| 0.56999999999992 | 1.455 | 2.175 | -5.105 |
| 0.57499999999992 | 1.469 | 2.169 | -5.131 |
| 0.57999999999992 | 1.484 | 2.164 | -5.156 |
| 0.58499999999992 | 1.498 | 2.158 | -5.182 |
| 0.58999999999992 | 1.512 | 2.152 | -5.208 |
| 0.59499999999992 | 1.526 | 2.146 | -5.234 |
| 0.59999999999992 | 1.54 | 2.14 | -5.26 |
| 0.60499999999992 | 1.554 | 2.134 | -5.286 |
| 0.60999999999992 | 1.568 | 2.128 | -5.312 |
| 0.61499999999992 | 1.582 | 2.122 | -5.338 |
| 0.61999999999992 | 1.596 | 2.116 | -5.364 |
| 0.62499999999992 | 1.609 | 2.109 | -5.391 |
| 0.62999999999992 | 1.623 | 2.103 | -5.417 |
| 0.63499999999992 | 1.637 | 2.097 | -5.443 |
| 0.63999999999992 | 1.65 | 2.09 | -5.47 |
| 0.64499999999992 | 1.664 | 2.084 | -5.496 |
| 0.64999999999992 | 1.677 | 2.078 | -5.522 |
| 0.65499999999992 | 1.691 | 2.071 | -5.549 |
| 0.65999999999992 | 1.704 | 2.064 | -5.576 |
| 0.66499999999992 | 1.718 | 2.058 | -5.602 |
| 0.66999999999992 | 1.731 | 2.051 | -5.629 |
| 0.67499999999992 | 1.744 | 2.044 | -5.656 |
| 0.67999999999992 | 1.758 | 2.038 | -5.682 |
| 0.68499999999992 | 1.771 | 2.031 | -5.709 |
| 0.68999999999992 | 1.784 | 2.024 | -5.736 |
| 0.69499999999992 | 1.797 | 2.017 | -5.763 |
| 0.69999999999992 | 1.81 | 2.01 | -5.79 |
| 0.70499999999992 | 1.823 | 2.003 | -5.817 |
| 0.70999999999992 | 1.836 | 1.996 | -5.844 |
| 0.71499999999992 | 1.849 | 1.989 | -5.871 |
| 0.71999999999992 | 1.862 | 1.982 | -5.898 |
| 0.72499999999992 | 1.874 | 1.974 | -5.926 |
| 0.72999999999992 | 1.887 | 1.967 | -5.953 |
| 0.73499999999992 | 1.9 | 1.96 | -5.98 |
| 0.73999999999992 | 1.912 | 1.952 | -6.008 |
| 0.74499999999992 | 1.925 | 1.945 | -6.035 |
| 0.74999999999992 | 1.937 | 1.938 | -6.062 |
| 0.75499999999992 | 1.95 | 1.93 | -6.09 |
| 0.75999999999992 | 1.962 | 1.922 | -6.118 |
| 0.76499999999992 | 1.975 | 1.915 | -6.145 |
| 0.76999999999992 | 1.987 | 1.907 | -6.173 |
| 0.77499999999992 | 1.999 | 1.899 | -6.201 |
| 0.77999999999992 | 2.012 | 1.892 | -6.228 |
| 0.78499999999992 | 2.024 | 1.884 | -6.256 |
| 0.78999999999992 | 2.036 | 1.876 | -6.284 |
| 0.79499999999992 | 2.048 | 1.868 | -6.312 |
| 0.79999999999992 | 2.06 | 1.86 | -6.34 |
| 0.804999999999921 | 2.072 | 1.852 | -6.368 |
| 0.809999999999921 | 2.084 | 1.844 | -6.396 |
| 0.814999999999921 | 2.096 | 1.836 | -6.424 |
| 0.819999999999921 | 2.108 | 1.828 | -6.452 |
| 0.824999999999921 | 2.119 | 1.819 | -6.481 |
| 0.829999999999921 | 2.131 | 1.811 | -6.509 |
| 0.834999999999921 | 2.143 | 1.803 | -6.537 |
| 0.839999999999921 | 2.154 | 1.794 | -6.566 |
| 0.844999999999921 | 2.166 | 1.786 | -6.594 |
| 0.849999999999921 | 2.177 | 1.778 | -6.622 |
| 0.854999999999921 | 2.189 | 1.769 | -6.651 |
| 0.859999999999921 | 2.2 | 1.76 | -6.68 |
| 0.864999999999921 | 2.212 | 1.752 | -6.708 |
| 0.869999999999921 | 2.223 | 1.743 | -6.737 |
| 0.874999999999921 | 2.234 | 1.734 | -6.766 |
| 0.879999999999921 | 2.246 | 1.726 | -6.794 |
| 0.884999999999921 | 2.257 | 1.717 | -6.823 |
| 0.889999999999921 | 2.268 | 1.708 | -6.852 |
| 0.894999999999921 | 2.279 | 1.699 | -6.881 |
| 0.899999999999921 | 2.29 | 1.69 | -6.91 |
| 0.904999999999921 | 2.301 | 1.681 | -6.939 |
| 0.909999999999921 | 2.312 | 1.672 | -6.968 |
| 0.914999999999921 | 2.323 | 1.663 | -6.997 |
| 0.919999999999921 | 2.334 | 1.654 | -7.026 |
| 0.924999999999921 | 2.344 | 1.644 | -7.056 |
| 0.929999999999921 | 2.355 | 1.635 | -7.085 |
| 0.934999999999921 | 2.366 | 1.626 | -7.114 |
| 0.939999999999921 | 2.376 | 1.616 | -7.144 |
| 0.944999999999921 | 2.387 | 1.607 | -7.173 |
| 0.949999999999921 | 2.397 | 1.598 | -7.202 |
| 0.954999999999921 | 2.408 | 1.588 | -7.232 |
| 0.959999999999921 | 2.418 | 1.578 | -7.262 |
| 0.964999999999921 | 2.429 | 1.569 | -7.291 |
| 0.969999999999921 | 2.439 | 1.559 | -7.321 |
| 0.974999999999921 | 2.449 | 1.549 | -7.351 |
| 0.979999999999921 | 2.46 | 1.54 | -7.38 |
| 0.984999999999921 | 2.47 | 1.53 | -7.41 |
| 0.989999999999921 | 2.48 | 1.52 | -7.44 |
| 0.994999999999921 | 2.49 | 1.51 | -7.47 |
| 0.999999999999921 | 2.5 | 1.5 | -7.5 |
| 1.004999999999921 | 2.51 | 1.49 | -7.53 |
| 1.009999999999921 | 2.52 | 1.48 | -7.56 |
| 1.01499999999992 | 2.53 | 1.47 | -7.59 |
| 1.01999999999992 | 2.54 | 1.46 | -7.62 |
| 1.02499999999992 | 2.549 | 1.449 | -7.651 |
| 1.02999999999992 | 2.559 | 1.439 | -7.681 |
| 1.03499999999992 | 2.569 | 1.429 | -7.711 |
| 1.03999999999992 | 2.578 | 1.418 | -7.742 |
| 1.04499999999992 | 2.588 | 1.408 | -7.772 |
| 1.04999999999992 | 2.597 | 1.398 | -7.802 |
| 1.05499999999992 | 2.607 | 1.387 | -7.833 |
| 1.059999999999919 | 2.616 | 1.376 | -7.864 |
| 1.064999999999919 | 2.626 | 1.366 | -7.894 |
| 1.069999999999919 | 2.635 | 1.355 | -7.925 |
| 1.074999999999919 | 2.644 | 1.344 | -7.956 |
| 1.079999999999919 | 2.654 | 1.334 | -7.986 |
| 1.084999999999919 | 2.663 | 1.323 | -8.017 |
| 1.089999999999919 | 2.672 | 1.312 | -8.048 |
| 1.094999999999919 | 2.681 | 1.301 | -8.079 |
| 1.099999999999919 | 2.69 | 1.29 | -8.11 |
| 1.104999999999918 | 2.699 | 1.279 | -8.141 |
| 1.109999999999918 | 2.708 | 1.268 | -8.172 |
| 1.114999999999918 | 2.717 | 1.257 | -8.203 |
| 1.119999999999918 | 2.726 | 1.246 | -8.234 |
| 1.124999999999918 | 2.734 | 1.234 | -8.266 |
| 1.129999999999918 | 2.743 | 1.223 | -8.297 |
| 1.134999999999918 | 2.752 | 1.212 | -8.328 |
| 1.139999999999918 | 2.76 | 1.2 | -8.36 |
| 1.144999999999918 | 2.769 | 1.189 | -8.391 |
| 1.149999999999918 | 2.777 | 1.178 | -8.422 |
| 1.154999999999917 | 2.786 | 1.166 | -8.454 |
| 1.159999999999917 | 2.794 | 1.154 | -8.486 |
| 1.164999999999917 | 2.803 | 1.143 | -8.517 |
| 1.169999999999917 | 2.811 | 1.131 | -8.549 |
| 1.174999999999917 | 2.819 | 1.119 | -8.581 |
| 1.179999999999917 | 2.828 | 1.108 | -8.612 |
| 1.184999999999917 | 2.836 | 1.096 | -8.644 |
| 1.189999999999917 | 2.844 | 1.084 | -8.676 |
| 1.194999999999917 | 2.852 | 1.072 | -8.708 |
| 1.199999999999916 | 2.86 | 1.06 | -8.74 |
| 1.204999999999916 | 2.868 | 1.048 | -8.772 |
| 1.209999999999916 | 2.876 | 1.036 | -8.804 |
| 1.214999999999916 | 2.884 | 1.024 | -8.836 |
| 1.219999999999916 | 2.892 | 1.012 | -8.868 |
| 1.224999999999916 | 2.899 | 0.999 | -8.901 |
| 1.229999999999916 | 2.907 | 0.987 | -8.933 |
| 1.234999999999916 | 2.915 | 0.975 | -8.965 |
| 1.239999999999916 | 2.922 | 0.962 | -8.998 |
| 1.244999999999915 | 2.93 | 0.95 | -9.03 |
| 1.249999999999915 | 2.937 | 0.938 | -9.062 |
| 1.254999999999915 | 2.945 | 0.925 | -9.095 |
| 1.259999999999915 | 2.952 | 0.912 | -9.128 |
| 1.264999999999915 | 2.96 | 0.9 | -9.16 |
| 1.269999999999915 | 2.967 | 0.887 | -9.193 |
| 1.274999999999915 | 2.974 | 0.874 | -9.226 |
| 1.279999999999915 | 2.982 | 0.862 | -9.258 |
| 1.284999999999915 | 2.989 | 0.849 | -9.291 |
| 1.289999999999915 | 2.996 | 0.836 | -9.324 |
| 1.294999999999914 | 3.003 | 0.823 | -9.357 |
| 1.299999999999914 | 3.01 | 0.81 | -9.39 |
| 1.304999999999914 | 3.017 | 0.797 | -9.423 |
| 1.309999999999914 | 3.024 | 0.784 | -9.456 |
| 1.314999999999914 | 3.031 | 0.771 | -9.489 |
| 1.319999999999914 | 3.038 | 0.758 | -9.522 |
| 1.324999999999914 | 3.044 | 0.744 | -9.556 |
| 1.329999999999914 | 3.051 | 0.731 | -9.589 |
| 1.334999999999914 | 3.058 | 0.718 | -9.622 |
| 1.339999999999913 | 3.064 | 0.704 | -9.656 |
| 1.344999999999913 | 3.071 | 0.691 | -9.689 |
| 1.349999999999913 | 3.077 | 0.678 | -9.722 |
| 1.354999999999913 | 3.084 | 0.664 | -9.756 |
| 1.359999999999913 | 3.09 | 0.65 | -9.79 |
| 1.364999999999913 | 3.097 | 0.637 | -9.823 |
| 1.369999999999913 | 3.103 | 0.623 | -9.857 |
| 1.374999999999913 | 3.109 | 0.609 | -9.891 |
| 1.379999999999913 | 3.116 | 0.596 | -9.924 |
| 1.384999999999912 | 3.122 | 0.582 | -9.958 |
| 1.389999999999912 | 3.128 | 0.568 | -9.992 |
| 1.394999999999912 | 3.134 | 0.554 | -10.026 |
| 1.399999999999912 | 3.14 | 0.54 | -10.06 |
| 1.404999999999912 | 3.146 | 0.526 | -10.094 |
| 1.409999999999912 | 3.152 | 0.512 | -10.128 |
| 1.414999999999912 | 3.158 | 0.498 | -10.162 |
| 1.419999999999912 | 3.164 | 0.484 | -10.196 |
| 1.424999999999912 | 3.169 | 0.469 | -10.231 |
| 1.429999999999912 | 3.175 | 0.455 | -10.265 |
| 1.434999999999911 | 3.181 | 0.441 | -10.299 |
| 1.439999999999911 | 3.186 | 0.426 | -10.334 |
| 1.444999999999911 | 3.192 | 0.412 | -10.368 |
| 1.449999999999911 | 3.197 | 0.398 | -10.402 |
| 1.454999999999911 | 3.203 | 0.383 | -10.437 |
| 1.459999999999911 | 3.208 | 0.368 | -10.472 |
| 1.464999999999911 | 3.214 | 0.354 | -10.506 |
| 1.469999999999911 | 3.219 | 0.339 | -10.541 |
| 1.474999999999911 | 3.224 | 0.324 | -10.576 |
| 1.47999999999991 | 3.23 | 0.31 | -10.61 |
| 1.48499999999991 | 3.235 | 0.295 | -10.645 |
| 1.48999999999991 | 3.24 | 0.28 | -10.68 |
| 1.49499999999991 | 3.245 | 0.265 | -10.715 |
| 1.49999999999991 | 3.25 | 0.25 | -10.75 |
| 1.50499999999991 | 3.255 | 0.235 | -10.785 |
| 1.50999999999991 | 3.26 | 0.22 | -10.82 |
| 1.51499999999991 | 3.265 | 0.205 | -10.855 |
| 1.51999999999991 | 3.27 | 0.19 | -10.89 |
| 1.52499999999991 | 3.274 | 0.174 | -10.926 |
| 1.529999999999909 | 3.279 | 0.159 | -10.961 |
| 1.534999999999909 | 3.284 | 0.144 | -10.996 |
| 1.539999999999909 | 3.288 | 0.128 | -11.032 |
| 1.544999999999909 | 3.293 | 0.113 | -11.067 |
| 1.549999999999909 | 3.297 | 0.098 | -11.102 |
| 1.554999999999909 | 3.302 | 0.082 | -11.138 |
| 1.559999999999909 | 3.306 | 0.066 | -11.174 |
| 1.564999999999909 | 3.311 | 0.051 | -11.209 |
| 1.569999999999909 | 3.315 | 0.035 | -11.245 |
| 1.574999999999908 | 3.319 | 0.019 | -11.281 |
| 1.579999999999908 | 3.324 | 0.004 | -11.316 |
| 1.584999999999908 | 3.328 | -0.012 | -11.352 |
| 1.589999999999908 | 3.332 | -0.028 | -11.388 |
| 1.594999999999908 | 3.336 | -0.044 | -11.424 |
| 1.599999999999908 | 3.34 | -0.06 | -11.46 |
| 1.604999999999908 | 3.344 | -0.076 | -11.496 |
| 1.609999999999908 | 3.348 | -0.092 | -11.532 |
| 1.614999999999908 | 3.352 | -0.108 | -11.568 |
| 1.619999999999907 | 3.356 | -0.124 | -11.604 |
| 1.624999999999907 | 3.359 | -0.141 | -11.641 |
| 1.629999999999907 | 3.363 | -0.157 | -11.677 |
| 1.634999999999907 | 3.367 | -0.173 | -11.713 |
| 1.639999999999907 | 3.37 | -0.19 | -11.75 |
| 1.644999999999907 | 3.374 | -0.206 | -11.786 |
| 1.649999999999907 | 3.377 | -0.222 | -11.822 |
| 1.654999999999907 | 3.381 | -0.239 | -11.859 |
| 1.659999999999907 | 3.384 | -0.256 | -11.896 |
| 1.664999999999906 | 3.388 | -0.272 | -11.932 |
| 1.669999999999906 | 3.391 | -0.289 | -11.969 |
| 1.674999999999906 | 3.394 | -0.306 | -12.006 |
| 1.679999999999906 | 3.398 | -0.322 | -12.042 |
| 1.684999999999906 | 3.401 | -0.339 | -12.079 |
| 1.689999999999906 | 3.404 | -0.356 | -12.116 |
| 1.694999999999906 | 3.407 | -0.373 | -12.153 |
| 1.699999999999906 | 3.41 | -0.39 | -12.19 |
| 1.704999999999906 | 3.413 | -0.407 | -12.227 |
| 1.709999999999906 | 3.416 | -0.424 | -12.264 |
| 1.714999999999905 | 3.419 | -0.441 | -12.301 |
| 1.719999999999905 | 3.422 | -0.458 | -12.338 |
| 1.724999999999905 | 3.424 | -0.476 | -12.376 |
| 1.729999999999905 | 3.427 | -0.493 | -12.413 |
| 1.734999999999905 | 3.43 | -0.51 | -12.45 |
| 1.739999999999905 | 3.432 | -0.528 | -12.488 |
| 1.744999999999905 | 3.435 | -0.545 | -12.525 |
| 1.749999999999905 | 3.437 | -0.562 | -12.562 |
| 1.754999999999905 | 3.44 | -0.58 | -12.6 |
| 1.759999999999904 | 3.442 | -0.598 | -12.638 |
| 1.764999999999904 | 3.445 | -0.615 | -12.675 |
| 1.769999999999904 | 3.447 | -0.633 | -12.713 |
| 1.774999999999904 | 3.449 | -0.651 | -12.751 |
| 1.779999999999904 | 3.452 | -0.668 | -12.788 |
| 1.784999999999904 | 3.454 | -0.686 | -12.826 |
| 1.789999999999904 | 3.456 | -0.704 | -12.864 |
| 1.794999999999904 | 3.458 | -0.722 | -12.902 |
| 1.799999999999904 | 3.46 | -0.74 | -12.94 |
| 1.804999999999904 | 3.462 | -0.758 | -12.978 |
| 1.809999999999903 | 3.464 | -0.776 | -13.016 |
| 1.814999999999903 | 3.466 | -0.794 | -13.054 |
| 1.819999999999903 | 3.468 | -0.812 | -13.092 |
| 1.824999999999903 | 3.469 | -0.831 | -13.131 |
| 1.829999999999903 | 3.471 | -0.849 | -13.169 |
| 1.834999999999903 | 3.473 | -0.867 | -13.207 |
| 1.839999999999903 | 3.474 | -0.886 | -13.246 |
| 1.844999999999903 | 3.476 | -0.904 | -13.284 |
| 1.849999999999903 | 3.477 | -0.922 | -13.322 |
| 1.854999999999902 | 3.479 | -0.941 | -13.361 |
| 1.859999999999902 | 3.48 | -0.96 | -13.4 |
| 1.864999999999902 | 3.482 | -0.978 | -13.438 |
| 1.869999999999902 | 3.483 | -0.997 | -13.477 |
| 1.874999999999902 | 3.484 | -1.016 | -13.516 |
| 1.879999999999902 | 3.486 | -1.034 | -13.554 |
| 1.884999999999902 | 3.487 | -1.053 | -13.593 |
| 1.889999999999902 | 3.488 | -1.072 | -13.632 |
| 1.894999999999902 | 3.489 | -1.091 | -13.671 |
| 1.899999999999901 | 3.49 | -1.11 | -13.71 |
| 1.904999999999901 | 3.491 | -1.129 | -13.749 |
| 1.909999999999901 | 3.492 | -1.148 | -13.788 |
| 1.914999999999901 | 3.493 | -1.167 | -13.827 |
| 1.919999999999901 | 3.494 | -1.186 | -13.866 |
| 1.924999999999901 | 3.494 | -1.206 | -13.906 |
| 1.929999999999901 | 3.495 | -1.225 | -13.945 |
| 1.934999999999901 | 3.496 | -1.244 | -13.984 |
| 1.939999999999901 | 3.496 | -1.264 | -14.024 |
| 1.944999999999901 | 3.497 | -1.283 | -14.063 |
| 1.9499999999999 | 3.497 | -1.302 | -14.102 |
| 1.9549999999999 | 3.498 | -1.322 | -14.142 |
| 1.9599999999999 | 3.498 | -1.342 | -14.182 |
| 1.9649999999999 | 3.499 | -1.361 | -14.221 |
| 1.9699999999999 | 3.499 | -1.381 | -14.261 |
| 1.9749999999999 | 3.499 | -1.401 | -14.301 |
| 1.9799999999999 | 3.5 | -1.42 | -14.34 |
| 1.9849999999999 | 3.5 | -1.44 | -14.38 |
| 1.9899999999999 | 3.5 | -1.46 | -14.42 |
| 1.994999999999899 | 3.5 | -1.48 | -14.46 |
| 1.999999999999899 | 3.5 | -1.5 | -14.5 |
| 2.0049999999999 | 3.5 | -1.52 | -14.54 |
| 2.009999999999899 | 3.5 | -1.54 | -14.58 |
| 2.014999999999899 | 3.5 | -1.56 | -14.62 |
| 2.019999999999899 | 3.5 | -1.58 | -14.66 |
| 2.024999999999899 | 3.499 | -1.601 | -14.701 |
| 2.029999999999899 | 3.499 | -1.621 | -14.741 |
| 2.034999999999899 | 3.499 | -1.641 | -14.781 |
| 2.039999999999899 | 3.498 | -1.662 | -14.822 |
| 2.044999999999899 | 3.498 | -1.682 | -14.862 |
| 2.049999999999899 | 3.498 | -1.702 | -14.902 |
| 2.054999999999898 | 3.497 | -1.723 | -14.943 |
| 2.059999999999898 | 3.496 | -1.744 | -14.984 |
| 2.064999999999898 | 3.496 | -1.764 | -15.024 |
| 2.069999999999898 | 3.495 | -1.785 | -15.065 |
| 2.074999999999898 | 3.494 | -1.806 | -15.106 |
| 2.079999999999898 | 3.494 | -1.826 | -15.146 |
| 2.084999999999898 | 3.493 | -1.847 | -15.187 |
| 2.089999999999898 | 3.492 | -1.868 | -15.228 |
| 2.094999999999898 | 3.491 | -1.889 | -15.269 |
| 2.099999999999897 | 3.49 | -1.91 | -15.31 |
| 2.104999999999897 | 3.489 | -1.931 | -15.351 |
| 2.109999999999897 | 3.488 | -1.952 | -15.392 |
| 2.114999999999897 | 3.487 | -1.973 | -15.433 |
| 2.119999999999897 | 3.486 | -1.994 | -15.474 |
| 2.124999999999897 | 3.484 | -2.016 | -15.516 |
| 2.129999999999897 | 3.483 | -2.037 | -15.557 |
| 2.134999999999897 | 3.482 | -2.058 | -15.598 |
| 2.139999999999897 | 3.48 | -2.08 | -15.64 |
| 2.144999999999897 | 3.479 | -2.101 | -15.681 |
| 2.149999999999896 | 3.478 | -2.122 | -15.722 |
| 2.154999999999896 | 3.476 | -2.144 | -15.764 |
| 2.159999999999896 | 3.474 | -2.166 | -15.806 |
| 2.164999999999896 | 3.473 | -2.187 | -15.847 |
| 2.169999999999896 | 3.471 | -2.209 | -15.889 |
| 2.174999999999896 | 3.469 | -2.231 | -15.931 |
| 2.179999999999896 | 3.468 | -2.252 | -15.972 |
| 2.184999999999896 | 3.466 | -2.274 | -16.014 |
| 2.189999999999896 | 3.464 | -2.296 | -16.056 |
| 2.194999999999895 | 3.462 | -2.318 | -16.098 |
| 2.199999999999895 | 3.46 | -2.34 | -16.14 |
| 2.204999999999895 | 3.458 | -2.362 | -16.182 |
| 2.209999999999895 | 3.456 | -2.384 | -16.224 |
| 2.214999999999895 | 3.454 | -2.406 | -16.266 |
| 2.219999999999895 | 3.452 | -2.428 | -16.308 |
| 2.224999999999895 | 3.449 | -2.451 | -16.351 |
| 2.229999999999895 | 3.447 | -2.473 | -16.393 |
| 2.234999999999895 | 3.445 | -2.495 | -16.435 |
| 2.239999999999894 | 3.442 | -2.518 | -16.478 |
| 2.244999999999894 | 3.44 | -2.54 | -16.52 |
| 2.249999999999894 | 3.438 | -2.562 | -16.562 |
| 2.254999999999894 | 3.435 | -2.585 | -16.605 |
| 2.259999999999894 | 3.432 | -2.608 | -16.648 |
| 2.264999999999894 | 3.43 | -2.63 | -16.69 |
| 2.269999999999894 | 3.427 | -2.653 | -16.733 |
| 2.274999999999894 | 3.424 | -2.676 | -16.776 |
| 2.279999999999894 | 3.422 | -2.698 | -16.818 |
| 2.284999999999894 | 3.419 | -2.721 | -16.861 |
| 2.289999999999893 | 3.416 | -2.744 | -16.904 |
| 2.294999999999893 | 3.413 | -2.767 | -16.947 |
| 2.299999999999893 | 3.41 | -2.79 | -16.99 |
| 2.304999999999893 | 3.407 | -2.813 | -17.033 |
| 2.309999999999893 | 3.404 | -2.836 | -17.076 |
| 2.314999999999893 | 3.401 | -2.859 | -17.119 |
| 2.319999999999893 | 3.398 | -2.882 | -17.162 |
| 2.324999999999893 | 3.394 | -2.906 | -17.206 |
| 2.329999999999893 | 3.391 | -2.929 | -17.249 |
| 2.334999999999892 | 3.388 | -2.952 | -17.292 |
| 2.339999999999892 | 3.384 | -2.976 | -17.336 |
| 2.344999999999892 | 3.381 | -2.999 | -17.379 |
| 2.349999999999892 | 3.378 | -3.022 | -17.422 |
| 2.354999999999892 | 3.374 | -3.046 | -17.466 |
| 2.359999999999892 | 3.37 | -3.07 | -17.51 |
| 2.364999999999892 | 3.367 | -3.093 | -17.553 |
| 2.369999999999892 | 3.363 | -3.117 | -17.597 |
| 2.374999999999892 | 3.359 | -3.141 | -17.641 |
| 2.379999999999891 | 3.356 | -3.164 | -17.684 |
| 2.384999999999891 | 3.352 | -3.188 | -17.728 |
| 2.389999999999891 | 3.348 | -3.212 | -17.772 |
| 2.394999999999891 | 3.344 | -3.236 | -17.816 |
| 2.399999999999891 | 3.34 | -3.26 | -17.86 |
| 2.404999999999891 | 3.336 | -3.284 | -17.904 |
| 2.409999999999891 | 3.332 | -3.308 | -17.948 |
| 2.414999999999891 | 3.328 | -3.332 | -17.992 |
| 2.419999999999891 | 3.324 | -3.356 | -18.036 |
| 2.424999999999891 | 3.319 | -3.381 | -18.081 |
| 2.42999999999989 | 3.315 | -3.405 | -18.125 |
| 2.43499999999989 | 3.311 | -3.429 | -18.169 |
| 2.43999999999989 | 3.306 | -3.454 | -18.214 |
| 2.44499999999989 | 3.302 | -3.478 | -18.258 |
| 2.44999999999989 | 3.298 | -3.502 | -18.302 |
| 2.45499999999989 | 3.293 | -3.527 | -18.347 |
| 2.45999999999989 | 3.288 | -3.552 | -18.392 |
| 2.46499999999989 | 3.284 | -3.576 | -18.436 |
| 2.46999999999989 | 3.279 | -3.601 | -18.481 |
| 2.474999999999889 | 3.274 | -3.626 | -18.526 |
| 2.479999999999889 | 3.27 | -3.65 | -18.57 |
| 2.484999999999889 | 3.265 | -3.675 | -18.615 |
| 2.489999999999889 | 3.26 | -3.7 | -18.66 |
| 2.494999999999889 | 3.255 | -3.725 | -18.705 |
| 2.499999999999889 | 3.25 | -3.75 | -18.75 |
| 2.504999999999889 | 3.245 | -3.775 | -18.795 |
| 2.509999999999889 | 3.24 | -3.8 | -18.84 |
| 2.514999999999889 | 3.235 | -3.825 | -18.885 |
| 2.519999999999889 | 3.23 | -3.85 | -18.93 |
| 2.524999999999888 | 3.224 | -3.876 | -18.976 |
| 2.529999999999888 | 3.219 | -3.901 | -19.021 |
| 2.534999999999888 | 3.214 | -3.926 | -19.066 |
| 2.539999999999888 | 3.208 | -3.952 | -19.112 |
| 2.544999999999888 | 3.203 | -3.977 | -19.157 |
| 2.549999999999888 | 3.198 | -4.002 | -19.202 |
| 2.554999999999888 | 3.192 | -4.028 | -19.248 |
| 2.559999999999888 | 3.186 | -4.054 | -19.294 |
| 2.564999999999888 | 3.181 | -4.079 | -19.339 |
| 2.569999999999887 | 3.175 | -4.105 | -19.385 |
| 2.574999999999887 | 3.169 | -4.131 | -19.431 |
| 2.579999999999887 | 3.164 | -4.156 | -19.476 |
| 2.584999999999887 | 3.158 | -4.182 | -19.522 |
| 2.589999999999887 | 3.152 | -4.208 | -19.568 |
| 2.594999999999887 | 3.146 | -4.234 | -19.614 |
| 2.599999999999887 | 3.14 | -4.26 | -19.66 |
| 2.604999999999887 | 3.134 | -4.286 | -19.706 |
| 2.609999999999887 | 3.128 | -4.312 | -19.752 |
| 2.614999999999886 | 3.122 | -4.338 | -19.798 |
| 2.619999999999886 | 3.116 | -4.364 | -19.844 |
| 2.624999999999886 | 3.109 | -4.391 | -19.891 |
| 2.629999999999886 | 3.103 | -4.417 | -19.937 |
| 2.634999999999886 | 3.097 | -4.443 | -19.983 |
| 2.639999999999886 | 3.09 | -4.47 | -20.03 |
| 2.644999999999886 | 3.084 | -4.496 | -20.076 |
| 2.649999999999886 | 3.078 | -4.522 | -20.122 |
| 2.654999999999886 | 3.071 | -4.549 | -20.169 |
| 2.659999999999885 | 3.064 | -4.576 | -20.216 |
| 2.664999999999885 | 3.058 | -4.602 | -20.262 |
| 2.669999999999885 | 3.051 | -4.629 | -20.309 |
| 2.674999999999885 | 3.044 | -4.656 | -20.356 |
| 2.679999999999885 | 3.038 | -4.682 | -20.402 |
| 2.684999999999885 | 3.031 | -4.709 | -20.449 |
| 2.689999999999885 | 3.024 | -4.736 | -20.496 |
| 2.694999999999885 | 3.017 | -4.763 | -20.543 |
| 2.699999999999885 | 3.01 | -4.79 | -20.59 |
| 2.704999999999885 | 3.003 | -4.817 | -20.637 |
| 2.709999999999884 | 2.996 | -4.844 | -20.684 |
| 2.714999999999884 | 2.989 | -4.871 | -20.731 |
| 2.719999999999884 | 2.982 | -4.898 | -20.778 |
| 2.724999999999884 | 2.974 | -4.926 | -20.826 |
| 2.729999999999884 | 2.967 | -4.953 | -20.873 |
| 2.734999999999884 | 2.96 | -4.98 | -20.92 |
| 2.739999999999884 | 2.952 | -5.008 | -20.968 |
| 2.744999999999884 | 2.945 | -5.035 | -21.015 |
| 2.749999999999884 | 2.938 | -5.062 | -21.062 |
| 2.754999999999883 | 2.93 | -5.09 | -21.11 |
| 2.759999999999883 | 2.922 | -5.118 | -21.158 |
| 2.764999999999883 | 2.915 | -5.145 | -21.205 |
| 2.769999999999883 | 2.907 | -5.173 | -21.253 |
| 2.774999999999883 | 2.899 | -5.201 | -21.301 |
| 2.779999999999883 | 2.892 | -5.228 | -21.348 |
| 2.784999999999883 | 2.884 | -5.256 | -21.396 |
| 2.789999999999883 | 2.876 | -5.284 | -21.444 |
| 2.794999999999883 | 2.868 | -5.312 | -21.492 |
| 2.799999999999882 | 2.86 | -5.34 | -21.54 |
| 2.804999999999882 | 2.852 | -5.368 | -21.588 |
| 2.809999999999882 | 2.844 | -5.396 | -21.636 |
| 2.814999999999882 | 2.836 | -5.424 | -21.684 |
| 2.819999999999882 | 2.828 | -5.452 | -21.732 |
| 2.824999999999882 | 2.819 | -5.481 | -21.781 |
| 2.829999999999882 | 2.811 | -5.509 | -21.829 |
| 2.834999999999882 | 2.803 | -5.537 | -21.877 |
| 2.839999999999882 | 2.794 | -5.566 | -21.926 |
| 2.844999999999882 | 2.786 | -5.594 | -21.974 |
| 2.849999999999881 | 2.778 | -5.622 | -22.022 |
| 2.854999999999881 | 2.769 | -5.651 | -22.071 |
| 2.859999999999881 | 2.76 | -5.68 | -22.12 |
| 2.864999999999881 | 2.752 | -5.708 | -22.168 |
| 2.869999999999881 | 2.743 | -5.737 | -22.217 |
| 2.874999999999881 | 2.734 | -5.766 | -22.266 |
| 2.879999999999881 | 2.726 | -5.794 | -22.314 |
| 2.884999999999881 | 2.717 | -5.823 | -22.363 |
| 2.889999999999881 | 2.708 | -5.852 | -22.412 |
| 2.89499999999988 | 2.699 | -5.881 | -22.461 |
| 2.89999999999988 | 2.69 | -5.91 | -22.51 |
| 2.90499999999988 | 2.681 | -5.939 | -22.559 |
| 2.90999999999988 | 2.672 | -5.968 | -22.608 |
| 2.91499999999988 | 2.663 | -5.997 | -22.657 |
| 2.91999999999988 | 2.654 | -6.026 | -22.706 |
| 2.92499999999988 | 2.644 | -6.056 | -22.756 |
| 2.92999999999988 | 2.635 | -6.085 | -22.805 |
| 2.93499999999988 | 2.626 | -6.114 | -22.854 |
| 2.93999999999988 | 2.616 | -6.144 | -22.904 |
| 2.944999999999879 | 2.607 | -6.173 | -22.953 |
| 2.949999999999879 | 2.598 | -6.202 | -23.002 |
| 2.954999999999879 | 2.588 | -6.232 | -23.052 |
| 2.959999999999879 | 2.578 | -6.262 | -23.102 |
| 2.964999999999879 | 2.569 | -6.291 | -23.151 |
| 2.969999999999879 | 2.559 | -6.321 | -23.201 |
| 2.974999999999879 | 2.549 | -6.351 | -23.251 |
| 2.979999999999879 | 2.54 | -6.38 | -23.3 |
| 2.984999999999879 | 2.53 | -6.41 | -23.35 |
| 2.989999999999878 | 2.52 | -6.44 | -23.4 |
| 2.994999999999878 | 2.51 | -6.47 | -23.45 |
| 2.999999999999878 | 2.5 | -6.5 | -23.5 |
| 3.004999999999878 | 2.49 | -6.53 | -23.55 |
| 3.009999999999878 | 2.48 | -6.56 | -23.6 |
| 3.014999999999878 | 2.47 | -6.59 | -23.65 |
| 3.019999999999878 | 2.46 | -6.62 | -23.7 |
| 3.024999999999878 | 2.449 | -6.651 | -23.751 |
| 3.029999999999878 | 2.439 | -6.681 | -23.801 |
| 3.034999999999878 | 2.429 | -6.711 | -23.851 |
| 3.039999999999877 | 2.418 | -6.742 | -23.902 |
| 3.044999999999877 | 2.408 | -6.772 | -23.952 |
| 3.049999999999877 | 2.398 | -6.802 | -24.002 |
| 3.054999999999877 | 2.387 | -6.833 | -24.053 |
| 3.059999999999877 | 2.376 | -6.864 | -24.104 |
| 3.064999999999877 | 2.366 | -6.894 | -24.154 |
| 3.069999999999877 | 2.355 | -6.925 | -24.205 |
| 3.074999999999877 | 2.344 | -6.956 | -24.256 |
| 3.079999999999877 | 2.334 | -6.986 | -24.306 |
| 3.084999999999876 | 2.323 | -7.017 | -24.357 |
| 3.089999999999876 | 2.312 | -7.048 | -24.408 |
| 3.094999999999876 | 2.301 | -7.079 | -24.459 |
| 3.099999999999876 | 2.29 | -7.11 | -24.51 |
| 3.104999999999876 | 2.279 | -7.141 | -24.561 |
| 3.109999999999876 | 2.268 | -7.172 | -24.612 |
| 3.114999999999876 | 2.257 | -7.203 | -24.663 |
| 3.119999999999876 | 2.246 | -7.234 | -24.714 |
| 3.124999999999876 | 2.234 | -7.266 | -24.766 |
| 3.129999999999876 | 2.223 | -7.297 | -24.817 |
| 3.134999999999875 | 2.212 | -7.328 | -24.868 |
| 3.139999999999875 | 2.2 | -7.36 | -24.92 |
| 3.144999999999875 | 2.189 | -7.391 | -24.971 |
| 3.149999999999875 | 2.178 | -7.422 | -25.022 |
| 3.154999999999875 | 2.166 | -7.454 | -25.074 |
| 3.159999999999875 | 2.154 | -7.486 | -25.126 |
| 3.164999999999875 | 2.143 | -7.517 | -25.177 |
| 3.169999999999875 | 2.131 | -7.549 | -25.229 |
| 3.174999999999875 | 2.119 | -7.581 | -25.281 |
| 3.179999999999874 | 2.108 | -7.612 | -25.332 |
| 3.184999999999874 | 2.096 | -7.644 | -25.384 |
| 3.189999999999874 | 2.084 | -7.676 | -25.436 |
| 3.194999999999874 | 2.072 | -7.708 | -25.488 |
| 3.199999999999874 | 2.06 | -7.74 | -25.54 |
| 3.204999999999874 | 2.048 | -7.772 | -25.592 |
| 3.209999999999874 | 2.036 | -7.804 | -25.644 |
| 3.214999999999874 | 2.024 | -7.836 | -25.696 |
| 3.219999999999874 | 2.012 | -7.868 | -25.748 |
| 3.224999999999874 | 1.999 | -7.901 | -25.801 |
| 3.229999999999873 | 1.987 | -7.933 | -25.853 |
| 3.234999999999873 | 1.975 | -7.965 | -25.905 |
| 3.239999999999873 | 1.962 | -7.998 | -25.958 |
| 3.244999999999873 | 1.95 | -8.03 | -26.01 |
| 3.249999999999873 | 1.938 | -8.062 | -26.062 |
| 3.254999999999873 | 1.925 | -8.095 | -26.115 |
| 3.259999999999873 | 1.912 | -8.128 | -26.168 |
| 3.264999999999873 | 1.9 | -8.16 | -26.22 |
| 3.269999999999873 | 1.887 | -8.193 | -26.273 |
| 3.274999999999872 | 1.874 | -8.226 | -26.326 |
| 3.279999999999872 | 1.862 | -8.258 | -26.378 |
| 3.284999999999872 | 1.849 | -8.291 | -26.431 |
| 3.289999999999872 | 1.836 | -8.324 | -26.484 |
| 3.294999999999872 | 1.823 | -8.357 | -26.537 |
| 3.299999999999872 | 1.81 | -8.39 | -26.59 |
| 3.304999999999872 | 1.797 | -8.423 | -26.643 |
| 3.309999999999872 | 1.784 | -8.456 | -26.696 |
| 3.314999999999872 | 1.771 | -8.489 | -26.749 |
| 3.319999999999871 | 1.758 | -8.522 | -26.802 |
| 3.324999999999871 | 1.744 | -8.556 | -26.856 |
| 3.329999999999871 | 1.731 | -8.589 | -26.909 |
| 3.334999999999871 | 1.718 | -8.622 | -26.962 |
| 3.339999999999871 | 1.704 | -8.656 | -27.016 |
| 3.344999999999871 | 1.691 | -8.689 | -27.069 |
| 3.349999999999871 | 1.678 | -8.722 | -27.122 |
| 3.354999999999871 | 1.664 | -8.756 | -27.176 |
| 3.359999999999871 | 1.65 | -8.79 | -27.23 |
| 3.36499999999987 | 1.637 | -8.823 | -27.283 |
| 3.36999999999987 | 1.623 | -8.857 | -27.337 |
| 3.37499999999987 | 1.609 | -8.891 | -27.391 |
| 3.37999999999987 | 1.596 | -8.924 | -27.444 |
| 3.38499999999987 | 1.582 | -8.958 | -27.498 |
| 3.38999999999987 | 1.568 | -8.992 | -27.552 |
| 3.39499999999987 | 1.554 | -9.026 | -27.606 |
| 3.39999999999987 | 1.54 | -9.06 | -27.66 |
| 3.40499999999987 | 1.526 | -9.094 | -27.714 |
| 3.40999999999987 | 1.512 | -9.128 | -27.768 |
| 3.414999999999869 | 1.498 | -9.162 | -27.822 |
| 3.419999999999869 | 1.484 | -9.196 | -27.876 |
| 3.424999999999869 | 1.469 | -9.231 | -27.931 |
| 3.429999999999869 | 1.455 | -9.265 | -27.985 |
| 3.434999999999869 | 1.441 | -9.299 | -28.039 |
| 3.439999999999869 | 1.426 | -9.334 | -28.094 |
| 3.444999999999869 | 1.412 | -9.368 | -28.148 |
| 3.449999999999869 | 1.398 | -9.402 | -28.202 |
| 3.454999999999869 | 1.383 | -9.437 | -28.257 |
| 3.459999999999868 | 1.368 | -9.472 | -28.312 |
| 3.464999999999868 | 1.354 | -9.506 | -28.366 |
| 3.469999999999868 | 1.339 | -9.541 | -28.421 |
| 3.474999999999868 | 1.324 | -9.576 | -28.476 |
| 3.479999999999868 | 1.31 | -9.61 | -28.53 |
| 3.484999999999868 | 1.295 | -9.645 | -28.585 |
| 3.489999999999868 | 1.28 | -9.68 | -28.64 |
| 3.494999999999868 | 1.265 | -9.715 | -28.695 |
| 3.499999999999868 | 1.25 | -9.75 | -28.75 |
| 3.504999999999868 | 1.235 | -9.785 | -28.805 |
| 3.509999999999867 | 1.22 | -9.82 | -28.86 |
| 3.514999999999867 | 1.205 | -9.855 | -28.915 |
| 3.519999999999867 | 1.19 | -9.89 | -28.97 |
| 3.524999999999867 | 1.174 | -9.926 | -29.026 |
| 3.529999999999867 | 1.159 | -9.961 | -29.081 |
| 3.534999999999867 | 1.144 | -9.996 | -29.136 |
| 3.539999999999867 | 1.128 | -10.032 | -29.192 |
| 3.544999999999867 | 1.113 | -10.067 | -29.247 |
| 3.549999999999867 | 1.098 | -10.102 | -29.302 |
| 3.554999999999866 | 1.082 | -10.138 | -29.358 |
| 3.559999999999866 | 1.066 | -10.174 | -29.414 |
| 3.564999999999866 | 1.051 | -10.209 | -29.469 |
| 3.569999999999866 | 1.035 | -10.245 | -29.525 |
| 3.574999999999866 | 1.019 | -10.281 | -29.581 |
| 3.579999999999866 | 1.004 | -10.316 | -29.636 |
| 3.584999999999866 | 0.988 | -10.352 | -29.692 |
| 3.589999999999866 | 0.972 | -10.388 | -29.748 |
| 3.594999999999866 | 0.956 | -10.424 | -29.804 |
| 3.599999999999866 | 0.94 | -10.46 | -29.86 |
| 3.604999999999865 | 0.924 | -10.496 | -29.916 |
| 3.609999999999865 | 0.908 | -10.532 | -29.972 |
| 3.614999999999865 | 0.892 | -10.568 | -30.028 |
| 3.619999999999865 | 0.876 | -10.604 | -30.084 |
| 3.624999999999865 | 0.859 | -10.641 | -30.141 |
| 3.629999999999865 | 0.843 | -10.677 | -30.197 |
| 3.634999999999865 | 0.827 | -10.713 | -30.253 |
| 3.639999999999865 | 0.81 | -10.75 | -30.31 |
| 3.644999999999864 | 0.794 | -10.786 | -30.366 |
| 3.649999999999864 | 0.778 | -10.822 | -30.422 |
| 3.654999999999864 | 0.761 | -10.859 | -30.479 |
| 3.659999999999864 | 0.744 | -10.896 | -30.536 |
| 3.664999999999864 | 0.728 | -10.932 | -30.592 |
| 3.669999999999864 | 0.711 | -10.969 | -30.649 |
| 3.674999999999864 | 0.694 | -11.006 | -30.706 |
| 3.679999999999864 | 0.678 | -11.042 | -30.762 |
| 3.684999999999864 | 0.661 | -11.079 | -30.819 |
| 3.689999999999864 | 0.644 | -11.116 | -30.876 |
| 3.694999999999863 | 0.627 | -11.153 | -30.933 |
| 3.699999999999863 | 0.61 | -11.19 | -30.99 |
| 3.704999999999863 | 0.593 | -11.227 | -31.047 |
| 3.709999999999863 | 0.576 | -11.264 | -31.104 |
| 3.714999999999863 | 0.559 | -11.301 | -31.161 |
| 3.719999999999863 | 0.542 | -11.338 | -31.218 |
| 3.724999999999863 | 0.524 | -11.376 | -31.276 |
| 3.729999999999863 | 0.507 | -11.413 | -31.333 |
| 3.734999999999863 | 0.49 | -11.45 | -31.39 |
| 3.739999999999862 | 0.472 | -11.488 | -31.448 |
| 3.744999999999862 | 0.455 | -11.525 | -31.505 |
| 3.749999999999862 | 0.438 | -11.562 | -31.562 |
| 3.754999999999862 | 0.42 | -11.6 | -31.62 |
| 3.759999999999862 | 0.402 | -11.638 | -31.678 |
| 3.764999999999862 | 0.385 | -11.675 | -31.735 |
| 3.769999999999862 | 0.367 | -11.713 | -31.793 |
| 3.774999999999862 | 0.349 | -11.751 | -31.851 |
| 3.779999999999862 | 0.332 | -11.788 | -31.908 |
| 3.784999999999862 | 0.314 | -11.826 | -31.966 |
| 3.789999999999861 | 0.296 | -11.864 | -32.024 |
| 3.794999999999861 | 0.278 | -11.902 | -32.082 |
| 3.799999999999861 | 0.26 | -11.94 | -32.14 |
| 3.804999999999861 | 0.242 | -11.978 | -32.198 |
| 3.809999999999861 | 0.224 | -12.016 | -32.256 |
| 3.814999999999861 | 0.206 | -12.054 | -32.314 |
| 3.819999999999861 | 0.188 | -12.092 | -32.372 |
| 3.824999999999861 | 0.169 | -12.131 | -32.431 |
| 3.829999999999861 | 0.151 | -12.169 | -32.489 |
| 3.83499999999986 | 0.133 | -12.207 | -32.547 |
| 3.83999999999986 | 0.114 | -12.246 | -32.606 |
| 3.84499999999986 | 0.096 | -12.284 | -32.664 |
| 3.84999999999986 | 0.078 | -12.322 | -32.722 |
| 3.85499999999986 | 0.059 | -12.361 | -32.781 |
| 3.85999999999986 | 0.04 | -12.4 | -32.84 |
| 3.86499999999986 | 0.022 | -12.438 | -32.898 |
| 3.86999999999986 | 0.003 | -12.477 | -32.957 |
| 3.87499999999986 | -0.016 | -12.516 | -33.016 |
| 3.87999999999986 | -0.034 | -12.554 | -33.074 |
| 3.884999999999859 | -0.053 | -12.593 | -33.133 |
| 3.889999999999859 | -0.072 | -12.632 | -33.192 |
| 3.894999999999859 | -0.091 | -12.671 | -33.251 |
| 3.899999999999859 | -0.11 | -12.71 | -33.31 |
| 3.904999999999859 | -0.129 | -12.749 | -33.369 |
| 3.909999999999859 | -0.148 | -12.788 | -33.428 |
| 3.914999999999859 | -0.167 | -12.827 | -33.487 |
| 3.919999999999859 | -0.186 | -12.866 | -33.546 |
| 3.924999999999859 | -0.206 | -12.906 | -33.606 |
| 3.929999999999858 | -0.225 | -12.945 | -33.665 |
| 3.934999999999858 | -0.244 | -12.984 | -33.724 |
| 3.939999999999858 | -0.264 | -13.024 | -33.784 |
| 3.944999999999858 | -0.283 | -13.063 | -33.843 |
| 3.949999999999858 | -0.302 | -13.102 | -33.902 |
| 3.954999999999858 | -0.322 | -13.142 | -33.962 |
| 3.959999999999858 | -0.342 | -13.182 | -34.022 |
| 3.964999999999858 | -0.361 | -13.221 | -34.081 |
| 3.969999999999858 | -0.381 | -13.261 | -34.141 |
| 3.974999999999858 | -0.401 | -13.301 | -34.201 |
| 3.979999999999857 | -0.42 | -13.34 | -34.26 |
| 3.984999999999857 | -0.44 | -13.38 | -34.32 |
| 3.989999999999857 | -0.46 | -13.42 | -34.38 |
| 3.994999999999857 | -0.48 | -13.46 | -34.44 |
| 3.999999999999857 | -0.5 | -13.5 | -34.5 |
| 4.004999999999857 | -0.52 | -13.54 | -34.56 |
| 4.009999999999856 | -0.54 | -13.58 | -34.62 |
| 4.014999999999857 | -0.56 | -13.62 | -34.68 |
| 4.019999999999856 | -0.58 | -13.66 | -34.74 |
| 4.024999999999856 | -0.601 | -13.701 | -34.801 |
| 4.029999999999856 | -0.621 | -13.741 | -34.861 |
| 4.034999999999856 | -0.641 | -13.781 | -34.921 |
| 4.039999999999856 | -0.662 | -13.822 | -34.982 |
| 4.044999999999856 | -0.682 | -13.862 | -35.042 |
| 4.049999999999855 | -0.702 | -13.902 | -35.102 |
| 4.054999999999856 | -0.723 | -13.943 | -35.163 |
| 4.059999999999855 | -0.744 | -13.984 | -35.224 |
| 4.064999999999856 | -0.764 | -14.024 | -35.284 |
| 4.069999999999855 | -0.785 | -14.065 | -35.345 |
| 4.074999999999855 | -0.806 | -14.106 | -35.406 |
| 4.079999999999855 | -0.826 | -14.146 | -35.466 |
| 4.084999999999855 | -0.847 | -14.187 | -35.527 |
| 4.089999999999855 | -0.868 | -14.228 | -35.588 |
| 4.094999999999855 | -0.889 | -14.269 | -35.649 |
| 4.099999999999854 | -0.91 | -14.31 | -35.71 |
| 4.104999999999855 | -0.931 | -14.351 | -35.771 |
| 4.109999999999854 | -0.952 | -14.392 | -35.832 |
| 4.114999999999855 | -0.973 | -14.433 | -35.893 |
| 4.119999999999854 | -0.994 | -14.474 | -35.954 |
| 4.124999999999854 | -1.016 | -14.516 | -36.016 |
| 4.129999999999854 | -1.037 | -14.557 | -36.077 |
| 4.134999999999854 | -1.058 | -14.598 | -36.138 |
| 4.139999999999854 | -1.08 | -14.64 | -36.2 |
| 4.144999999999854 | -1.101 | -14.681 | -36.261 |
| 4.149999999999854 | -1.122 | -14.722 | -36.322 |
| 4.154999999999854 | -1.144 | -14.764 | -36.384 |
| 4.159999999999854 | -1.166 | -14.806 | -36.446 |
| 4.164999999999853 | -1.187 | -14.847 | -36.507 |
| 4.169999999999853 | -1.209 | -14.889 | -36.569 |
| 4.174999999999853 | -1.231 | -14.931 | -36.631 |
| 4.179999999999853 | -1.252 | -14.972 | -36.692 |
| 4.184999999999853 | -1.274 | -15.014 | -36.754 |
| 4.189999999999853 | -1.296 | -15.056 | -36.816 |
| 4.194999999999853 | -1.318 | -15.098 | -36.878 |
| 4.199999999999853 | -1.34 | -15.14 | -36.94 |
| 4.204999999999853 | -1.362 | -15.182 | -37.002 |
| 4.209999999999852 | -1.384 | -15.224 | -37.064 |
| 4.214999999999852 | -1.406 | -15.266 | -37.126 |
| 4.219999999999852 | -1.428 | -15.308 | -37.188 |
| 4.224999999999852 | -1.451 | -15.351 | -37.251 |
| 4.229999999999852 | -1.473 | -15.393 | -37.313 |
| 4.234999999999852 | -1.495 | -15.435 | -37.375 |
| 4.239999999999851 | -1.518 | -15.478 | -37.438 |
| 4.244999999999852 | -1.54 | -15.52 | -37.5 |
| 4.249999999999851 | -1.562 | -15.562 | -37.562 |
| 4.254999999999852 | -1.585 | -15.605 | -37.625 |
| 4.259999999999851 | -1.608 | -15.648 | -37.688 |
| 4.264999999999851 | -1.63 | -15.69 | -37.75 |
| 4.269999999999851 | -1.653 | -15.733 | -37.813 |
| 4.274999999999851 | -1.676 | -15.776 | -37.876 |
| 4.27999999999985 | -1.698 | -15.818 | -37.938 |
| 4.284999999999851 | -1.721 | -15.861 | -38.001 |
| 4.28999999999985 | -1.744 | -15.904 | -38.064 |
| 4.294999999999851 | -1.767 | -15.947 | -38.127 |
| 4.29999999999985 | -1.79 | -15.99 | -38.19 |
| 4.30499999999985 | -1.813 | -16.033 | -38.253 |
| 4.30999999999985 | -1.836 | -16.076 | -38.316 |
| 4.31499999999985 | -1.859 | -16.119 | -38.379 |
| 4.31999999999985 | -1.882 | -16.162 | -38.442 |
| 4.32499999999985 | -1.906 | -16.206 | -38.506 |
| 4.32999999999985 | -1.929 | -16.249 | -38.569 |
| 4.33499999999985 | -1.952 | -16.292 | -38.632 |
| 4.33999999999985 | -1.976 | -16.336 | -38.696 |
| 4.34499999999985 | -1.999 | -16.379 | -38.759 |
| 4.34999999999985 | -2.022 | -16.422 | -38.822 |
| 4.354999999999849 | -2.046 | -16.466 | -38.886 |
| 4.35999999999985 | -2.07 | -16.51 | -38.95 |
| 4.364999999999849 | -2.093 | -16.553 | -39.013 |
| 4.36999999999985 | -2.117 | -16.597 | -39.077 |
| 4.374999999999849 | -2.141 | -16.641 | -39.141 |
| 4.379999999999848 | -2.164 | -16.684 | -39.204 |
| 4.384999999999849 | -2.188 | -16.728 | -39.268 |
| 4.389999999999848 | -2.212 | -16.772 | -39.332 |
| 4.394999999999849 | -2.236 | -16.816 | -39.396 |
| 4.399999999999848 | -2.26 | -16.86 | -39.46 |
| 4.404999999999848 | -2.284 | -16.904 | -39.524 |
| 4.409999999999848 | -2.308 | -16.948 | -39.588 |
| 4.414999999999848 | -2.332 | -16.992 | -39.652 |
| 4.419999999999848 | -2.356 | -17.036 | -39.716 |
| 4.424999999999848 | -2.381 | -17.081 | -39.781 |
| 4.429999999999847 | -2.405 | -17.125 | -39.845 |
| 4.434999999999847 | -2.429 | -17.169 | -39.909 |
| 4.439999999999847 | -2.454 | -17.214 | -39.974 |
| 4.444999999999847 | -2.478 | -17.258 | -40.038 |
| 4.449999999999847 | -2.502 | -17.302 | -40.102 |
| 4.454999999999847 | -2.527 | -17.347 | -40.167 |
| 4.459999999999847 | -2.552 | -17.392 | -40.232 |
| 4.464999999999847 | -2.576 | -17.436 | -40.296 |
| 4.469999999999846 | -2.601 | -17.481 | -40.361 |
| 4.474999999999846 | -2.626 | -17.526 | -40.426 |
| 4.479999999999846 | -2.65 | -17.57 | -40.49 |
| 4.484999999999846 | -2.675 | -17.615 | -40.555 |
| 4.489999999999846 | -2.7 | -17.66 | -40.62 |
| 4.494999999999846 | -2.725 | -17.705 | -40.685 |
| 4.499999999999846 | -2.75 | -17.75 | -40.75 |
| 4.504999999999846 | -2.775 | -17.795 | -40.815 |
| 4.509999999999846 | -2.8 | -17.84 | -40.88 |
| 4.514999999999846 | -2.825 | -17.885 | -40.945 |
| 4.519999999999845 | -2.85 | -17.93 | -41.01 |
| 4.524999999999846 | -2.876 | -17.976 | -41.076 |
| 4.529999999999845 | -2.901 | -18.021 | -41.141 |
| 4.534999999999845 | -2.926 | -18.066 | -41.206 |
| 4.539999999999845 | -2.952 | -18.112 | -41.272 |
| 4.544999999999845 | -2.977 | -18.157 | -41.337 |
| 4.549999999999845 | -3.002 | -18.202 | -41.402 |
| 4.554999999999845 | -3.028 | -18.248 | -41.468 |
| 4.559999999999845 | -3.054 | -18.294 | -41.534 |
| 4.564999999999845 | -3.079 | -18.339 | -41.599 |
| 4.569999999999844 | -3.105 | -18.385 | -41.665 |
| 4.574999999999844 | -3.131 | -18.431 | -41.731 |
| 4.579999999999844 | -3.156 | -18.476 | -41.796 |
| 4.584999999999844 | -3.182 | -18.522 | -41.862 |
| 4.589999999999844 | -3.208 | -18.568 | -41.928 |
| 4.594999999999844 | -3.234 | -18.614 | -41.994 |
| 4.599999999999844 | -3.26 | -18.66 | -42.06 |
| 4.604999999999844 | -3.286 | -18.706 | -42.126 |
| 4.609999999999844 | -3.312 | -18.752 | -42.192 |
| 4.614999999999844 | -3.338 | -18.798 | -42.258 |
| 4.619999999999844 | -3.364 | -18.844 | -42.324 |
| 4.624999999999844 | -3.391 | -18.891 | -42.391 |
| 4.629999999999843 | -3.417 | -18.937 | -42.457 |
| 4.634999999999843 | -3.443 | -18.983 | -42.523 |
| 4.639999999999843 | -3.47 | -19.03 | -42.59 |
| 4.644999999999843 | -3.496 | -19.076 | -42.656 |
| 4.649999999999843 | -3.522 | -19.122 | -42.722 |
| 4.654999999999843 | -3.549 | -19.169 | -42.789 |
| 4.659999999999843 | -3.576 | -19.216 | -42.856 |
| 4.664999999999843 | -3.602 | -19.262 | -42.922 |
| 4.669999999999843 | -3.629 | -19.309 | -42.989 |
| 4.674999999999843 | -3.656 | -19.356 | -43.056 |
| 4.679999999999842 | -3.682 | -19.402 | -43.122 |
| 4.684999999999842 | -3.709 | -19.449 | -43.189 |
| 4.689999999999842 | -3.736 | -19.496 | -43.256 |
| 4.694999999999842 | -3.763 | -19.543 | -43.323 |
| 4.699999999999842 | -3.79 | -19.59 | -43.39 |
| 4.704999999999842 | -3.817 | -19.637 | -43.457 |
| 4.709999999999841 | -3.844 | -19.684 | -43.524 |
| 4.714999999999842 | -3.871 | -19.731 | -43.591 |
| 4.719999999999841 | -3.898 | -19.778 | -43.658 |
| 4.724999999999841 | -3.926 | -19.826 | -43.726 |
| 4.729999999999841 | -3.953 | -19.873 | -43.793 |
| 4.734999999999841 | -3.98 | -19.92 | -43.86 |
| 4.73999999999984 | -4.008 | -19.968 | -43.928 |
| 4.744999999999841 | -4.035 | -20.015 | -43.995 |
| 4.74999999999984 | -4.062 | -20.062 | -44.062 |
| 4.754999999999841 | -4.09 | -20.11 | -44.13 |
| 4.75999999999984 | -4.118 | -20.158 | -44.198 |
| 4.764999999999841 | -4.145 | -20.205 | -44.265 |
| 4.76999999999984 | -4.173 | -20.253 | -44.333 |
| 4.77499999999984 | -4.201 | -20.301 | -44.401 |
| 4.77999999999984 | -4.228 | -20.348 | -44.468 |
| 4.78499999999984 | -4.256 | -20.396 | -44.536 |
| 4.78999999999984 | -4.284 | -20.444 | -44.604 |
| 4.79499999999984 | -4.312 | -20.492 | -44.672 |
| 4.79999999999984 | -4.34 | -20.54 | -44.74 |
| 4.80499999999984 | -4.368 | -20.588 | -44.808 |
| 4.80999999999984 | -4.396 | -20.636 | -44.876 |
| 4.81499999999984 | -4.424 | -20.684 | -44.944 |
| 4.81999999999984 | -4.452 | -20.732 | -45.012 |
| 4.824999999999839 | -4.481 | -20.781 | -45.081 |
| 4.82999999999984 | -4.509 | -20.829 | -45.149 |
| 4.83499999999984 | -4.537 | -20.877 | -45.217 |
| 4.83999999999984 | -4.566 | -20.926 | -45.286 |
| 4.844999999999839 | -4.594 | -20.974 | -45.354 |
| 4.849999999999838 | -4.622 | -21.022 | -45.422 |
| 4.854999999999839 | -4.651 | -21.071 | -45.491 |
| 4.859999999999838 | -4.68 | -21.12 | -45.56 |
| 4.864999999999839 | -4.708 | -21.168 | -45.628 |
| 4.869999999999838 | -4.737 | -21.217 | -45.697 |
| 4.874999999999838 | -4.766 | -21.266 | -45.766 |
| 4.879999999999838 | -4.794 | -21.314 | -45.834 |
| 4.884999999999838 | -4.823 | -21.363 | -45.903 |
| 4.889999999999837 | -4.852 | -21.412 | -45.972 |
| 4.894999999999838 | -4.881 | -21.461 | -46.041 |
| 4.899999999999837 | -4.91 | -21.51 | -46.11 |
| 4.904999999999837 | -4.939 | -21.559 | -46.179 |
| 4.909999999999837 | -4.968 | -21.608 | -46.248 |
| 4.914999999999837 | -4.997 | -21.657 | -46.317 |
| 4.919999999999837 | -5.026 | -21.706 | -46.386 |
| 4.924999999999837 | -5.056 | -21.756 | -46.456 |
| 4.929999999999837 | -5.085 | -21.805 | -46.525 |
| 4.934999999999837 | -5.114 | -21.854 | -46.594 |
| 4.939999999999836 | -5.144 | -21.904 | -46.664 |
| 4.944999999999836 | -5.173 | -21.953 | -46.733 |
| 4.949999999999836 | -5.202 | -22.002 | -46.802 |
| 4.954999999999836 | -5.232 | -22.052 | -46.872 |
| 4.959999999999836 | -5.262 | -22.102 | -46.942 |
| 4.964999999999836 | -5.291 | -22.151 | -47.011 |
| 4.969999999999836 | -5.321 | -22.201 | -47.081 |
| 4.974999999999836 | -5.351 | -22.251 | -47.151 |
| 4.979999999999836 | -5.38 | -22.3 | -47.22 |
| 4.984999999999835 | -5.41 | -22.35 | -47.29 |
| 4.989999999999835 | -5.44 | -22.4 | -47.36 |
| 4.994999999999835 | -5.47 | -22.45 | -47.43 |
| 4.999999999999835 | -5.5 | -22.5 | -47.5 |
| 5.004999999999835 | -5.53 | -22.55 | -47.57 |
| 5.009999999999835 | -5.56 | -22.6 | -47.64 |
| 5.014999999999835 | -5.59 | -22.65 | -47.71 |
| 5.019999999999835 | -5.62 | -22.7 | -47.78 |
| 5.024999999999835 | -5.651 | -22.751 | -47.851 |
| 5.029999999999835 | -5.681 | -22.801 | -47.921 |
| 5.034999999999834 | -5.711 | -22.851 | -47.991 |
| 5.039999999999834 | -5.742 | -22.902 | -48.062 |
| 5.044999999999834 | -5.772 | -22.952 | -48.132 |
| 5.049999999999834 | -5.802 | -23.002 | -48.202 |
| 5.054999999999834 | -5.833 | -23.053 | -48.273 |
| 5.059999999999834 | -5.864 | -23.104 | -48.344 |
| 5.064999999999834 | -5.894 | -23.154 | -48.414 |
| 5.069999999999834 | -5.925 | -23.205 | -48.485 |
| 5.074999999999834 | -5.956 | -23.256 | -48.556 |
| 5.079999999999833 | -5.986 | -23.306 | -48.626 |
| 5.084999999999834 | -6.017 | -23.357 | -48.697 |
| 5.089999999999833 | -6.048 | -23.408 | -48.768 |
| 5.094999999999834 | -6.079 | -23.459 | -48.839 |
| 5.099999999999833 | -6.11 | -23.51 | -48.91 |
| 5.104999999999833 | -6.141 | -23.561 | -48.981 |
| 5.109999999999833 | -6.172 | -23.612 | -49.052 |
| 5.114999999999833 | -6.203 | -23.663 | -49.123 |
| 5.119999999999833 | -6.234 | -23.714 | -49.194 |
| 5.124999999999833 | -6.266 | -23.766 | -49.266 |
| 5.129999999999833 | -6.297 | -23.817 | -49.337 |
| 5.134999999999833 | -6.328 | -23.868 | -49.408 |
| 5.139999999999832 | -6.36 | -23.92 | -49.48 |
| 5.144999999999833 | -6.391 | -23.971 | -49.551 |
| 5.149999999999832 | -6.422 | -24.022 | -49.622 |
| 5.154999999999832 | -6.454 | -24.074 | -49.694 |
| 5.159999999999832 | -6.486 | -24.126 | -49.766 |
| 5.164999999999832 | -6.517 | -24.177 | -49.837 |
| 5.169999999999832 | -6.549 | -24.229 | -49.909 |
| 5.174999999999832 | -6.581 | -24.281 | -49.981 |
| 5.179999999999831 | -6.612 | -24.332 | -50.052 |
| 5.184999999999832 | -6.644 | -24.384 | -50.124 |
| 5.189999999999831 | -6.676 | -24.436 | -50.196 |
| 5.194999999999831 | -6.708 | -24.488 | -50.268 |
| 5.199999999999831 | -6.74 | -24.54 | -50.34 |